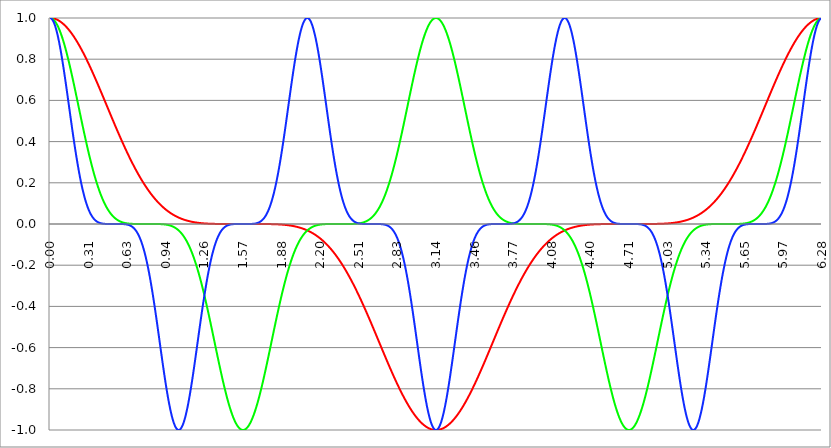
| Category | Series 1 | Series 0 | Series 2 |
|---|---|---|---|
| 0.0 | 1 | 1 | 1 |
| 0.00314159265358979 | 1 | 1 | 1 |
| 0.00628318530717958 | 1 | 1 | 0.999 |
| 0.00942477796076938 | 1 | 0.999 | 0.998 |
| 0.0125663706143592 | 1 | 0.998 | 0.996 |
| 0.015707963267949 | 0.999 | 0.998 | 0.994 |
| 0.0188495559215388 | 0.999 | 0.996 | 0.992 |
| 0.0219911485751285 | 0.999 | 0.995 | 0.989 |
| 0.0251327412287183 | 0.998 | 0.994 | 0.986 |
| 0.0282743338823081 | 0.998 | 0.992 | 0.982 |
| 0.0314159265358979 | 0.998 | 0.99 | 0.978 |
| 0.0345575191894877 | 0.997 | 0.988 | 0.973 |
| 0.0376991118430775 | 0.996 | 0.986 | 0.968 |
| 0.0408407044966673 | 0.996 | 0.983 | 0.963 |
| 0.0439822971502571 | 0.995 | 0.981 | 0.957 |
| 0.0471238898038469 | 0.994 | 0.978 | 0.951 |
| 0.0502654824574367 | 0.994 | 0.975 | 0.945 |
| 0.0534070751110265 | 0.993 | 0.972 | 0.938 |
| 0.0565486677646163 | 0.992 | 0.968 | 0.93 |
| 0.059690260418206 | 0.991 | 0.965 | 0.923 |
| 0.0628318530717958 | 0.99 | 0.961 | 0.915 |
| 0.0659734457253856 | 0.989 | 0.957 | 0.906 |
| 0.0691150383789754 | 0.988 | 0.953 | 0.897 |
| 0.0722566310325652 | 0.987 | 0.949 | 0.888 |
| 0.075398223686155 | 0.986 | 0.945 | 0.879 |
| 0.0785398163397448 | 0.985 | 0.94 | 0.869 |
| 0.0816814089933346 | 0.983 | 0.935 | 0.859 |
| 0.0848230016469244 | 0.982 | 0.93 | 0.849 |
| 0.0879645943005142 | 0.981 | 0.925 | 0.838 |
| 0.091106186954104 | 0.979 | 0.92 | 0.828 |
| 0.0942477796076937 | 0.978 | 0.915 | 0.817 |
| 0.0973893722612835 | 0.977 | 0.909 | 0.805 |
| 0.100530964914873 | 0.975 | 0.903 | 0.794 |
| 0.103672557568463 | 0.973 | 0.897 | 0.782 |
| 0.106814150222053 | 0.972 | 0.891 | 0.77 |
| 0.109955742875643 | 0.97 | 0.885 | 0.758 |
| 0.113097335529233 | 0.968 | 0.879 | 0.746 |
| 0.116238928182822 | 0.967 | 0.873 | 0.733 |
| 0.119380520836412 | 0.965 | 0.866 | 0.721 |
| 0.122522113490002 | 0.963 | 0.859 | 0.708 |
| 0.125663706143592 | 0.961 | 0.852 | 0.695 |
| 0.128805298797181 | 0.959 | 0.846 | 0.682 |
| 0.131946891450771 | 0.957 | 0.838 | 0.669 |
| 0.135088484104361 | 0.955 | 0.831 | 0.655 |
| 0.138230076757951 | 0.953 | 0.824 | 0.642 |
| 0.141371669411541 | 0.951 | 0.817 | 0.629 |
| 0.14451326206513 | 0.949 | 0.809 | 0.615 |
| 0.14765485471872 | 0.947 | 0.802 | 0.602 |
| 0.15079644737231 | 0.945 | 0.794 | 0.589 |
| 0.1539380400259 | 0.942 | 0.786 | 0.575 |
| 0.15707963267949 | 0.94 | 0.778 | 0.562 |
| 0.160221225333079 | 0.938 | 0.77 | 0.548 |
| 0.163362817986669 | 0.935 | 0.762 | 0.535 |
| 0.166504410640259 | 0.933 | 0.754 | 0.521 |
| 0.169646003293849 | 0.93 | 0.746 | 0.508 |
| 0.172787595947439 | 0.928 | 0.737 | 0.495 |
| 0.175929188601028 | 0.925 | 0.729 | 0.481 |
| 0.179070781254618 | 0.923 | 0.721 | 0.468 |
| 0.182212373908208 | 0.92 | 0.712 | 0.455 |
| 0.185353966561798 | 0.917 | 0.703 | 0.442 |
| 0.188495559215388 | 0.915 | 0.695 | 0.429 |
| 0.191637151868977 | 0.912 | 0.686 | 0.416 |
| 0.194778744522567 | 0.909 | 0.677 | 0.404 |
| 0.197920337176157 | 0.906 | 0.669 | 0.391 |
| 0.201061929829747 | 0.903 | 0.66 | 0.379 |
| 0.204203522483336 | 0.9 | 0.651 | 0.367 |
| 0.207345115136926 | 0.897 | 0.642 | 0.355 |
| 0.210486707790516 | 0.894 | 0.633 | 0.343 |
| 0.213628300444106 | 0.891 | 0.624 | 0.331 |
| 0.216769893097696 | 0.888 | 0.615 | 0.319 |
| 0.219911485751285 | 0.885 | 0.606 | 0.308 |
| 0.223053078404875 | 0.882 | 0.598 | 0.297 |
| 0.226194671058465 | 0.879 | 0.589 | 0.286 |
| 0.229336263712055 | 0.876 | 0.58 | 0.275 |
| 0.232477856365645 | 0.873 | 0.571 | 0.265 |
| 0.235619449019234 | 0.869 | 0.562 | 0.254 |
| 0.238761041672824 | 0.866 | 0.553 | 0.244 |
| 0.241902634326414 | 0.863 | 0.544 | 0.234 |
| 0.245044226980004 | 0.859 | 0.535 | 0.225 |
| 0.248185819633594 | 0.856 | 0.526 | 0.215 |
| 0.251327412287183 | 0.852 | 0.517 | 0.206 |
| 0.254469004940773 | 0.849 | 0.508 | 0.197 |
| 0.257610597594363 | 0.846 | 0.499 | 0.188 |
| 0.260752190247953 | 0.842 | 0.49 | 0.18 |
| 0.263893782901543 | 0.838 | 0.481 | 0.171 |
| 0.267035375555132 | 0.835 | 0.472 | 0.163 |
| 0.270176968208722 | 0.831 | 0.464 | 0.155 |
| 0.273318560862312 | 0.828 | 0.455 | 0.148 |
| 0.276460153515902 | 0.824 | 0.446 | 0.14 |
| 0.279601746169492 | 0.82 | 0.438 | 0.133 |
| 0.282743338823082 | 0.817 | 0.429 | 0.126 |
| 0.285884931476671 | 0.813 | 0.421 | 0.12 |
| 0.289026524130261 | 0.809 | 0.412 | 0.113 |
| 0.292168116783851 | 0.805 | 0.404 | 0.107 |
| 0.295309709437441 | 0.802 | 0.395 | 0.101 |
| 0.298451302091031 | 0.798 | 0.387 | 0.096 |
| 0.30159289474462 | 0.794 | 0.379 | 0.09 |
| 0.30473448739821 | 0.79 | 0.371 | 0.085 |
| 0.3078760800518 | 0.786 | 0.363 | 0.08 |
| 0.31101767270539 | 0.782 | 0.355 | 0.075 |
| 0.31415926535898 | 0.778 | 0.347 | 0.07 |
| 0.31730085801257 | 0.774 | 0.339 | 0.066 |
| 0.320442450666159 | 0.77 | 0.331 | 0.061 |
| 0.323584043319749 | 0.766 | 0.323 | 0.057 |
| 0.326725635973339 | 0.762 | 0.316 | 0.054 |
| 0.329867228626929 | 0.758 | 0.308 | 0.05 |
| 0.333008821280519 | 0.754 | 0.301 | 0.046 |
| 0.336150413934108 | 0.75 | 0.293 | 0.043 |
| 0.339292006587698 | 0.746 | 0.286 | 0.04 |
| 0.342433599241288 | 0.742 | 0.279 | 0.037 |
| 0.345575191894878 | 0.737 | 0.272 | 0.034 |
| 0.348716784548468 | 0.733 | 0.265 | 0.032 |
| 0.351858377202058 | 0.729 | 0.258 | 0.029 |
| 0.354999969855647 | 0.725 | 0.251 | 0.027 |
| 0.358141562509237 | 0.721 | 0.244 | 0.024 |
| 0.361283155162827 | 0.716 | 0.237 | 0.022 |
| 0.364424747816417 | 0.712 | 0.231 | 0.021 |
| 0.367566340470007 | 0.708 | 0.225 | 0.019 |
| 0.370707933123597 | 0.703 | 0.218 | 0.017 |
| 0.373849525777186 | 0.699 | 0.212 | 0.015 |
| 0.376991118430776 | 0.695 | 0.206 | 0.014 |
| 0.380132711084366 | 0.691 | 0.2 | 0.013 |
| 0.383274303737956 | 0.686 | 0.194 | 0.011 |
| 0.386415896391546 | 0.682 | 0.188 | 0.01 |
| 0.389557489045135 | 0.677 | 0.182 | 0.009 |
| 0.392699081698725 | 0.673 | 0.177 | 0.008 |
| 0.395840674352315 | 0.669 | 0.171 | 0.007 |
| 0.398982267005905 | 0.664 | 0.166 | 0.006 |
| 0.402123859659495 | 0.66 | 0.161 | 0.006 |
| 0.405265452313085 | 0.655 | 0.155 | 0.005 |
| 0.408407044966674 | 0.651 | 0.15 | 0.004 |
| 0.411548637620264 | 0.647 | 0.145 | 0.004 |
| 0.414690230273854 | 0.642 | 0.14 | 0.003 |
| 0.417831822927444 | 0.638 | 0.136 | 0.003 |
| 0.420973415581034 | 0.633 | 0.131 | 0.003 |
| 0.424115008234623 | 0.629 | 0.126 | 0.002 |
| 0.427256600888213 | 0.624 | 0.122 | 0.002 |
| 0.430398193541803 | 0.62 | 0.118 | 0.002 |
| 0.433539786195393 | 0.615 | 0.113 | 0.001 |
| 0.436681378848983 | 0.611 | 0.109 | 0.001 |
| 0.439822971502573 | 0.606 | 0.105 | 0.001 |
| 0.442964564156162 | 0.602 | 0.101 | 0.001 |
| 0.446106156809752 | 0.598 | 0.097 | 0.001 |
| 0.449247749463342 | 0.593 | 0.094 | 0.001 |
| 0.452389342116932 | 0.589 | 0.09 | 0 |
| 0.455530934770522 | 0.584 | 0.086 | 0 |
| 0.458672527424111 | 0.58 | 0.083 | 0 |
| 0.461814120077701 | 0.575 | 0.08 | 0 |
| 0.464955712731291 | 0.571 | 0.076 | 0 |
| 0.468097305384881 | 0.566 | 0.073 | 0 |
| 0.471238898038471 | 0.562 | 0.07 | 0 |
| 0.474380490692061 | 0.557 | 0.067 | 0 |
| 0.47752208334565 | 0.553 | 0.064 | 0 |
| 0.48066367599924 | 0.548 | 0.061 | 0 |
| 0.48380526865283 | 0.544 | 0.059 | 0 |
| 0.48694686130642 | 0.539 | 0.056 | 0 |
| 0.49008845396001 | 0.535 | 0.054 | 0 |
| 0.493230046613599 | 0.53 | 0.051 | 0 |
| 0.496371639267189 | 0.526 | 0.049 | 0 |
| 0.499513231920779 | 0.521 | 0.046 | 0 |
| 0.502654824574369 | 0.517 | 0.044 | 0 |
| 0.505796417227959 | 0.512 | 0.042 | 0 |
| 0.508938009881549 | 0.508 | 0.04 | 0 |
| 0.512079602535138 | 0.503 | 0.038 | 0 |
| 0.515221195188728 | 0.499 | 0.036 | 0 |
| 0.518362787842318 | 0.495 | 0.034 | 0 |
| 0.521504380495908 | 0.49 | 0.032 | 0 |
| 0.524645973149498 | 0.486 | 0.031 | 0 |
| 0.527787565803087 | 0.481 | 0.029 | 0 |
| 0.530929158456677 | 0.477 | 0.027 | 0 |
| 0.534070751110267 | 0.472 | 0.026 | 0 |
| 0.537212343763857 | 0.468 | 0.024 | 0 |
| 0.540353936417447 | 0.464 | 0.023 | 0 |
| 0.543495529071037 | 0.459 | 0.022 | 0 |
| 0.546637121724626 | 0.455 | 0.021 | 0 |
| 0.549778714378216 | 0.451 | 0.019 | 0 |
| 0.552920307031806 | 0.446 | 0.018 | 0 |
| 0.556061899685396 | 0.442 | 0.017 | 0 |
| 0.559203492338986 | 0.438 | 0.016 | 0 |
| 0.562345084992576 | 0.433 | 0.015 | 0 |
| 0.565486677646165 | 0.429 | 0.014 | 0 |
| 0.568628270299755 | 0.425 | 0.013 | 0 |
| 0.571769862953345 | 0.421 | 0.012 | 0 |
| 0.574911455606935 | 0.416 | 0.011 | 0 |
| 0.578053048260525 | 0.412 | 0.011 | 0 |
| 0.581194640914114 | 0.408 | 0.01 | 0 |
| 0.584336233567704 | 0.404 | 0.009 | 0 |
| 0.587477826221294 | 0.399 | 0.009 | 0 |
| 0.590619418874884 | 0.395 | 0.008 | 0 |
| 0.593761011528474 | 0.391 | 0.007 | 0 |
| 0.596902604182064 | 0.387 | 0.007 | 0 |
| 0.600044196835653 | 0.383 | 0.006 | -0.001 |
| 0.603185789489243 | 0.379 | 0.006 | -0.001 |
| 0.606327382142833 | 0.375 | 0.005 | -0.001 |
| 0.609468974796423 | 0.371 | 0.005 | -0.001 |
| 0.612610567450013 | 0.367 | 0.004 | -0.001 |
| 0.615752160103602 | 0.363 | 0.004 | -0.002 |
| 0.618893752757192 | 0.359 | 0.004 | -0.002 |
| 0.622035345410782 | 0.355 | 0.003 | -0.002 |
| 0.625176938064372 | 0.351 | 0.003 | -0.002 |
| 0.628318530717962 | 0.347 | 0.003 | -0.003 |
| 0.631460123371551 | 0.343 | 0.003 | -0.003 |
| 0.634601716025141 | 0.339 | 0.002 | -0.004 |
| 0.637743308678731 | 0.335 | 0.002 | -0.004 |
| 0.640884901332321 | 0.331 | 0.002 | -0.005 |
| 0.644026493985911 | 0.327 | 0.002 | -0.006 |
| 0.647168086639501 | 0.323 | 0.002 | -0.006 |
| 0.65030967929309 | 0.319 | 0.001 | -0.007 |
| 0.65345127194668 | 0.316 | 0.001 | -0.008 |
| 0.65659286460027 | 0.312 | 0.001 | -0.009 |
| 0.65973445725386 | 0.308 | 0.001 | -0.01 |
| 0.66287604990745 | 0.304 | 0.001 | -0.011 |
| 0.666017642561039 | 0.301 | 0.001 | -0.012 |
| 0.669159235214629 | 0.297 | 0.001 | -0.014 |
| 0.672300827868219 | 0.293 | 0.001 | -0.015 |
| 0.675442420521809 | 0.29 | 0 | -0.016 |
| 0.678584013175399 | 0.286 | 0 | -0.018 |
| 0.681725605828989 | 0.282 | 0 | -0.02 |
| 0.684867198482578 | 0.279 | 0 | -0.022 |
| 0.688008791136168 | 0.275 | 0 | -0.024 |
| 0.691150383789758 | 0.272 | 0 | -0.026 |
| 0.694291976443348 | 0.268 | 0 | -0.028 |
| 0.697433569096938 | 0.265 | 0 | -0.031 |
| 0.700575161750528 | 0.261 | 0 | -0.033 |
| 0.703716754404117 | 0.258 | 0 | -0.036 |
| 0.706858347057707 | 0.254 | 0 | -0.039 |
| 0.709999939711297 | 0.251 | 0 | -0.042 |
| 0.713141532364887 | 0.247 | 0 | -0.045 |
| 0.716283125018477 | 0.244 | 0 | -0.049 |
| 0.719424717672066 | 0.241 | 0 | -0.052 |
| 0.722566310325656 | 0.237 | 0 | -0.056 |
| 0.725707902979246 | 0.234 | 0 | -0.06 |
| 0.728849495632836 | 0.231 | 0 | -0.064 |
| 0.731991088286426 | 0.228 | 0 | -0.069 |
| 0.735132680940016 | 0.225 | 0 | -0.073 |
| 0.738274273593605 | 0.221 | 0 | -0.078 |
| 0.741415866247195 | 0.218 | 0 | -0.083 |
| 0.744557458900785 | 0.215 | 0 | -0.088 |
| 0.747699051554375 | 0.212 | 0 | -0.094 |
| 0.750840644207965 | 0.209 | 0 | -0.099 |
| 0.753982236861554 | 0.206 | 0 | -0.105 |
| 0.757123829515144 | 0.203 | 0 | -0.111 |
| 0.760265422168734 | 0.2 | 0 | -0.118 |
| 0.763407014822324 | 0.197 | 0 | -0.124 |
| 0.766548607475914 | 0.194 | 0 | -0.131 |
| 0.769690200129504 | 0.191 | 0 | -0.138 |
| 0.772831792783093 | 0.188 | 0 | -0.145 |
| 0.775973385436683 | 0.185 | 0 | -0.153 |
| 0.779114978090273 | 0.182 | 0 | -0.161 |
| 0.782256570743863 | 0.18 | 0 | -0.169 |
| 0.785398163397453 | 0.177 | 0 | -0.177 |
| 0.788539756051042 | 0.174 | 0 | -0.185 |
| 0.791681348704632 | 0.171 | 0 | -0.194 |
| 0.794822941358222 | 0.169 | 0 | -0.203 |
| 0.797964534011812 | 0.166 | 0 | -0.212 |
| 0.801106126665402 | 0.163 | 0 | -0.221 |
| 0.804247719318992 | 0.161 | 0 | -0.231 |
| 0.807389311972581 | 0.158 | 0 | -0.241 |
| 0.810530904626171 | 0.155 | 0 | -0.251 |
| 0.813672497279761 | 0.153 | 0 | -0.261 |
| 0.816814089933351 | 0.15 | 0 | -0.272 |
| 0.819955682586941 | 0.148 | 0 | -0.282 |
| 0.823097275240531 | 0.145 | 0 | -0.293 |
| 0.82623886789412 | 0.143 | 0 | -0.304 |
| 0.82938046054771 | 0.14 | 0 | -0.316 |
| 0.8325220532013 | 0.138 | 0 | -0.327 |
| 0.83566364585489 | 0.136 | 0 | -0.339 |
| 0.83880523850848 | 0.133 | 0 | -0.351 |
| 0.841946831162069 | 0.131 | 0 | -0.363 |
| 0.845088423815659 | 0.129 | 0 | -0.375 |
| 0.848230016469249 | 0.126 | 0 | -0.387 |
| 0.851371609122839 | 0.124 | 0 | -0.399 |
| 0.854513201776429 | 0.122 | 0 | -0.412 |
| 0.857654794430019 | 0.12 | 0 | -0.425 |
| 0.860796387083608 | 0.118 | 0 | -0.438 |
| 0.863937979737198 | 0.116 | 0 | -0.451 |
| 0.867079572390788 | 0.113 | 0 | -0.464 |
| 0.870221165044378 | 0.111 | 0 | -0.477 |
| 0.873362757697968 | 0.109 | 0 | -0.49 |
| 0.876504350351557 | 0.107 | 0 | -0.503 |
| 0.879645943005147 | 0.105 | 0 | -0.517 |
| 0.882787535658737 | 0.103 | 0 | -0.53 |
| 0.885929128312327 | 0.101 | 0 | -0.544 |
| 0.889070720965917 | 0.099 | 0 | -0.557 |
| 0.892212313619507 | 0.097 | 0 | -0.571 |
| 0.895353906273096 | 0.096 | 0 | -0.584 |
| 0.898495498926686 | 0.094 | -0.001 | -0.598 |
| 0.901637091580276 | 0.092 | -0.001 | -0.611 |
| 0.904778684233866 | 0.09 | -0.001 | -0.624 |
| 0.907920276887456 | 0.088 | -0.001 | -0.638 |
| 0.911061869541045 | 0.086 | -0.001 | -0.651 |
| 0.914203462194635 | 0.085 | -0.001 | -0.664 |
| 0.917345054848225 | 0.083 | -0.001 | -0.677 |
| 0.920486647501815 | 0.081 | -0.001 | -0.691 |
| 0.923628240155405 | 0.08 | -0.002 | -0.703 |
| 0.926769832808995 | 0.078 | -0.002 | -0.716 |
| 0.929911425462584 | 0.076 | -0.002 | -0.729 |
| 0.933053018116174 | 0.075 | -0.002 | -0.742 |
| 0.936194610769764 | 0.073 | -0.002 | -0.754 |
| 0.939336203423354 | 0.072 | -0.003 | -0.766 |
| 0.942477796076944 | 0.07 | -0.003 | -0.778 |
| 0.945619388730533 | 0.069 | -0.003 | -0.79 |
| 0.948760981384123 | 0.067 | -0.003 | -0.802 |
| 0.951902574037713 | 0.066 | -0.004 | -0.813 |
| 0.955044166691303 | 0.064 | -0.004 | -0.824 |
| 0.958185759344893 | 0.063 | -0.004 | -0.835 |
| 0.961327351998483 | 0.061 | -0.005 | -0.846 |
| 0.964468944652072 | 0.06 | -0.005 | -0.856 |
| 0.967610537305662 | 0.059 | -0.006 | -0.866 |
| 0.970752129959252 | 0.057 | -0.006 | -0.876 |
| 0.973893722612842 | 0.056 | -0.007 | -0.885 |
| 0.977035315266432 | 0.055 | -0.007 | -0.894 |
| 0.980176907920022 | 0.054 | -0.008 | -0.903 |
| 0.983318500573611 | 0.052 | -0.009 | -0.912 |
| 0.986460093227201 | 0.051 | -0.009 | -0.92 |
| 0.989601685880791 | 0.05 | -0.01 | -0.928 |
| 0.992743278534381 | 0.049 | -0.011 | -0.935 |
| 0.995884871187971 | 0.048 | -0.011 | -0.942 |
| 0.99902646384156 | 0.046 | -0.012 | -0.949 |
| 1.00216805649515 | 0.045 | -0.013 | -0.955 |
| 1.00530964914874 | 0.044 | -0.014 | -0.961 |
| 1.00845124180233 | 0.043 | -0.015 | -0.967 |
| 1.01159283445592 | 0.042 | -0.016 | -0.972 |
| 1.01473442710951 | 0.041 | -0.017 | -0.977 |
| 1.017876019763099 | 0.04 | -0.018 | -0.981 |
| 1.021017612416689 | 0.039 | -0.019 | -0.985 |
| 1.02415920507028 | 0.038 | -0.021 | -0.988 |
| 1.027300797723869 | 0.037 | -0.022 | -0.991 |
| 1.030442390377459 | 0.036 | -0.023 | -0.994 |
| 1.033583983031048 | 0.035 | -0.024 | -0.996 |
| 1.036725575684638 | 0.034 | -0.026 | -0.998 |
| 1.039867168338228 | 0.033 | -0.027 | -0.999 |
| 1.043008760991818 | 0.032 | -0.029 | -1 |
| 1.046150353645408 | 0.032 | -0.031 | -1 |
| 1.049291946298998 | 0.031 | -0.032 | -1 |
| 1.052433538952587 | 0.03 | -0.034 | -0.999 |
| 1.055575131606177 | 0.029 | -0.036 | -0.998 |
| 1.058716724259767 | 0.028 | -0.038 | -0.997 |
| 1.061858316913357 | 0.027 | -0.04 | -0.995 |
| 1.064999909566947 | 0.027 | -0.042 | -0.993 |
| 1.068141502220536 | 0.026 | -0.044 | -0.99 |
| 1.071283094874126 | 0.025 | -0.046 | -0.987 |
| 1.074424687527716 | 0.024 | -0.049 | -0.983 |
| 1.077566280181306 | 0.024 | -0.051 | -0.979 |
| 1.080707872834896 | 0.023 | -0.054 | -0.975 |
| 1.083849465488486 | 0.022 | -0.056 | -0.97 |
| 1.086991058142075 | 0.022 | -0.059 | -0.965 |
| 1.090132650795665 | 0.021 | -0.061 | -0.959 |
| 1.093274243449255 | 0.021 | -0.064 | -0.953 |
| 1.096415836102845 | 0.02 | -0.067 | -0.947 |
| 1.099557428756435 | 0.019 | -0.07 | -0.94 |
| 1.102699021410025 | 0.019 | -0.073 | -0.933 |
| 1.105840614063614 | 0.018 | -0.076 | -0.925 |
| 1.108982206717204 | 0.018 | -0.08 | -0.917 |
| 1.112123799370794 | 0.017 | -0.083 | -0.909 |
| 1.115265392024384 | 0.016 | -0.086 | -0.9 |
| 1.118406984677974 | 0.016 | -0.09 | -0.891 |
| 1.121548577331563 | 0.015 | -0.094 | -0.882 |
| 1.124690169985153 | 0.015 | -0.097 | -0.873 |
| 1.127831762638743 | 0.014 | -0.101 | -0.863 |
| 1.130973355292333 | 0.014 | -0.105 | -0.852 |
| 1.134114947945923 | 0.014 | -0.109 | -0.842 |
| 1.137256540599513 | 0.013 | -0.113 | -0.831 |
| 1.140398133253102 | 0.013 | -0.118 | -0.82 |
| 1.143539725906692 | 0.012 | -0.122 | -0.809 |
| 1.146681318560282 | 0.012 | -0.126 | -0.798 |
| 1.149822911213872 | 0.011 | -0.131 | -0.786 |
| 1.152964503867462 | 0.011 | -0.136 | -0.774 |
| 1.156106096521051 | 0.011 | -0.14 | -0.762 |
| 1.159247689174641 | 0.01 | -0.145 | -0.75 |
| 1.162389281828231 | 0.01 | -0.15 | -0.737 |
| 1.165530874481821 | 0.01 | -0.155 | -0.725 |
| 1.168672467135411 | 0.009 | -0.161 | -0.712 |
| 1.171814059789001 | 0.009 | -0.166 | -0.699 |
| 1.17495565244259 | 0.009 | -0.171 | -0.686 |
| 1.17809724509618 | 0.008 | -0.177 | -0.673 |
| 1.18123883774977 | 0.008 | -0.182 | -0.66 |
| 1.18438043040336 | 0.008 | -0.188 | -0.647 |
| 1.18752202305695 | 0.007 | -0.194 | -0.633 |
| 1.190663615710539 | 0.007 | -0.2 | -0.62 |
| 1.193805208364129 | 0.007 | -0.206 | -0.606 |
| 1.19694680101772 | 0.006 | -0.212 | -0.593 |
| 1.200088393671309 | 0.006 | -0.218 | -0.58 |
| 1.203229986324899 | 0.006 | -0.225 | -0.566 |
| 1.206371578978489 | 0.006 | -0.231 | -0.553 |
| 1.209513171632078 | 0.006 | -0.237 | -0.539 |
| 1.212654764285668 | 0.005 | -0.244 | -0.526 |
| 1.215796356939258 | 0.005 | -0.251 | -0.512 |
| 1.218937949592848 | 0.005 | -0.258 | -0.499 |
| 1.222079542246438 | 0.005 | -0.265 | -0.486 |
| 1.225221134900027 | 0.004 | -0.272 | -0.472 |
| 1.228362727553617 | 0.004 | -0.279 | -0.459 |
| 1.231504320207207 | 0.004 | -0.286 | -0.446 |
| 1.234645912860797 | 0.004 | -0.293 | -0.433 |
| 1.237787505514387 | 0.004 | -0.301 | -0.421 |
| 1.240929098167977 | 0.004 | -0.308 | -0.408 |
| 1.244070690821566 | 0.003 | -0.316 | -0.395 |
| 1.247212283475156 | 0.003 | -0.323 | -0.383 |
| 1.250353876128746 | 0.003 | -0.331 | -0.371 |
| 1.253495468782336 | 0.003 | -0.339 | -0.359 |
| 1.256637061435926 | 0.003 | -0.347 | -0.347 |
| 1.259778654089515 | 0.003 | -0.355 | -0.335 |
| 1.262920246743105 | 0.003 | -0.363 | -0.323 |
| 1.266061839396695 | 0.002 | -0.371 | -0.312 |
| 1.269203432050285 | 0.002 | -0.379 | -0.301 |
| 1.272345024703875 | 0.002 | -0.387 | -0.29 |
| 1.275486617357465 | 0.002 | -0.395 | -0.279 |
| 1.278628210011054 | 0.002 | -0.404 | -0.268 |
| 1.281769802664644 | 0.002 | -0.412 | -0.258 |
| 1.284911395318234 | 0.002 | -0.421 | -0.247 |
| 1.288052987971824 | 0.002 | -0.429 | -0.237 |
| 1.291194580625414 | 0.002 | -0.438 | -0.228 |
| 1.294336173279003 | 0.002 | -0.446 | -0.218 |
| 1.297477765932593 | 0.001 | -0.455 | -0.209 |
| 1.300619358586183 | 0.001 | -0.464 | -0.2 |
| 1.303760951239773 | 0.001 | -0.472 | -0.191 |
| 1.306902543893363 | 0.001 | -0.481 | -0.182 |
| 1.310044136546953 | 0.001 | -0.49 | -0.174 |
| 1.313185729200542 | 0.001 | -0.499 | -0.166 |
| 1.316327321854132 | 0.001 | -0.508 | -0.158 |
| 1.319468914507722 | 0.001 | -0.517 | -0.15 |
| 1.322610507161312 | 0.001 | -0.526 | -0.143 |
| 1.325752099814902 | 0.001 | -0.535 | -0.136 |
| 1.328893692468491 | 0.001 | -0.544 | -0.129 |
| 1.332035285122081 | 0.001 | -0.553 | -0.122 |
| 1.335176877775671 | 0.001 | -0.562 | -0.116 |
| 1.338318470429261 | 0.001 | -0.571 | -0.109 |
| 1.341460063082851 | 0.001 | -0.58 | -0.103 |
| 1.344601655736441 | 0.001 | -0.589 | -0.097 |
| 1.34774324839003 | 0.001 | -0.598 | -0.092 |
| 1.35088484104362 | 0 | -0.606 | -0.086 |
| 1.35402643369721 | 0 | -0.615 | -0.081 |
| 1.3571680263508 | 0 | -0.624 | -0.076 |
| 1.36030961900439 | 0 | -0.633 | -0.072 |
| 1.363451211657979 | 0 | -0.642 | -0.067 |
| 1.36659280431157 | 0 | -0.651 | -0.063 |
| 1.369734396965159 | 0 | -0.66 | -0.059 |
| 1.372875989618749 | 0 | -0.669 | -0.055 |
| 1.376017582272339 | 0 | -0.677 | -0.051 |
| 1.379159174925929 | 0 | -0.686 | -0.048 |
| 1.382300767579518 | 0 | -0.695 | -0.044 |
| 1.385442360233108 | 0 | -0.703 | -0.041 |
| 1.388583952886698 | 0 | -0.712 | -0.038 |
| 1.391725545540288 | 0 | -0.721 | -0.035 |
| 1.394867138193878 | 0 | -0.729 | -0.032 |
| 1.398008730847468 | 0 | -0.737 | -0.03 |
| 1.401150323501057 | 0 | -0.746 | -0.027 |
| 1.404291916154647 | 0 | -0.754 | -0.025 |
| 1.407433508808237 | 0 | -0.762 | -0.023 |
| 1.410575101461827 | 0 | -0.77 | -0.021 |
| 1.413716694115417 | 0 | -0.778 | -0.019 |
| 1.416858286769006 | 0 | -0.786 | -0.018 |
| 1.419999879422596 | 0 | -0.794 | -0.016 |
| 1.423141472076186 | 0 | -0.802 | -0.014 |
| 1.426283064729776 | 0 | -0.809 | -0.013 |
| 1.429424657383366 | 0 | -0.817 | -0.012 |
| 1.432566250036956 | 0 | -0.824 | -0.011 |
| 1.435707842690545 | 0 | -0.831 | -0.01 |
| 1.438849435344135 | 0 | -0.838 | -0.009 |
| 1.441991027997725 | 0 | -0.846 | -0.008 |
| 1.445132620651315 | 0 | -0.852 | -0.007 |
| 1.448274213304905 | 0 | -0.859 | -0.006 |
| 1.451415805958494 | 0 | -0.866 | -0.005 |
| 1.454557398612084 | 0 | -0.873 | -0.005 |
| 1.457698991265674 | 0 | -0.879 | -0.004 |
| 1.460840583919264 | 0 | -0.885 | -0.004 |
| 1.463982176572854 | 0 | -0.891 | -0.003 |
| 1.467123769226444 | 0 | -0.897 | -0.003 |
| 1.470265361880033 | 0 | -0.903 | -0.002 |
| 1.473406954533623 | 0 | -0.909 | -0.002 |
| 1.476548547187213 | 0 | -0.915 | -0.002 |
| 1.479690139840803 | 0 | -0.92 | -0.001 |
| 1.482831732494393 | 0 | -0.925 | -0.001 |
| 1.485973325147982 | 0 | -0.93 | -0.001 |
| 1.489114917801572 | 0 | -0.935 | -0.001 |
| 1.492256510455162 | 0 | -0.94 | -0.001 |
| 1.495398103108752 | 0 | -0.945 | -0.001 |
| 1.498539695762342 | 0 | -0.949 | 0 |
| 1.501681288415932 | 0 | -0.953 | 0 |
| 1.504822881069521 | 0 | -0.957 | 0 |
| 1.507964473723111 | 0 | -0.961 | 0 |
| 1.511106066376701 | 0 | -0.965 | 0 |
| 1.514247659030291 | 0 | -0.968 | 0 |
| 1.517389251683881 | 0 | -0.972 | 0 |
| 1.520530844337471 | 0 | -0.975 | 0 |
| 1.52367243699106 | 0 | -0.978 | 0 |
| 1.52681402964465 | 0 | -0.981 | 0 |
| 1.52995562229824 | 0 | -0.983 | 0 |
| 1.53309721495183 | 0 | -0.986 | 0 |
| 1.53623880760542 | 0 | -0.988 | 0 |
| 1.539380400259009 | 0 | -0.99 | 0 |
| 1.542521992912599 | 0 | -0.992 | 0 |
| 1.545663585566189 | 0 | -0.994 | 0 |
| 1.548805178219779 | 0 | -0.995 | 0 |
| 1.551946770873369 | 0 | -0.996 | 0 |
| 1.555088363526959 | 0 | -0.998 | 0 |
| 1.558229956180548 | 0 | -0.998 | 0 |
| 1.561371548834138 | 0 | -0.999 | 0 |
| 1.564513141487728 | 0 | -1 | 0 |
| 1.567654734141318 | 0 | -1 | 0 |
| 1.570796326794908 | 0 | -1 | 0 |
| 1.573937919448497 | 0 | -1 | 0 |
| 1.577079512102087 | 0 | -1 | 0 |
| 1.580221104755677 | 0 | -0.999 | 0 |
| 1.583362697409267 | 0 | -0.998 | 0 |
| 1.586504290062857 | 0 | -0.998 | 0 |
| 1.589645882716447 | 0 | -0.996 | 0 |
| 1.592787475370036 | 0 | -0.995 | 0 |
| 1.595929068023626 | 0 | -0.994 | 0 |
| 1.599070660677216 | 0 | -0.992 | 0 |
| 1.602212253330806 | 0 | -0.99 | 0 |
| 1.605353845984396 | 0 | -0.988 | 0 |
| 1.608495438637985 | 0 | -0.986 | 0 |
| 1.611637031291575 | 0 | -0.983 | 0 |
| 1.614778623945165 | 0 | -0.981 | 0 |
| 1.617920216598755 | 0 | -0.978 | 0 |
| 1.621061809252345 | 0 | -0.975 | 0 |
| 1.624203401905935 | 0 | -0.972 | 0 |
| 1.627344994559524 | 0 | -0.968 | 0 |
| 1.630486587213114 | 0 | -0.965 | 0 |
| 1.633628179866704 | 0 | -0.961 | 0 |
| 1.636769772520294 | 0 | -0.957 | 0 |
| 1.639911365173884 | 0 | -0.953 | 0 |
| 1.643052957827473 | 0 | -0.949 | 0 |
| 1.646194550481063 | 0 | -0.945 | 0.001 |
| 1.649336143134653 | 0 | -0.94 | 0.001 |
| 1.652477735788243 | 0 | -0.935 | 0.001 |
| 1.655619328441833 | 0 | -0.93 | 0.001 |
| 1.658760921095423 | 0 | -0.925 | 0.001 |
| 1.661902513749012 | 0 | -0.92 | 0.001 |
| 1.665044106402602 | 0 | -0.915 | 0.002 |
| 1.668185699056192 | 0 | -0.909 | 0.002 |
| 1.671327291709782 | 0 | -0.903 | 0.002 |
| 1.674468884363372 | 0 | -0.897 | 0.003 |
| 1.677610477016961 | 0 | -0.891 | 0.003 |
| 1.680752069670551 | 0 | -0.885 | 0.004 |
| 1.683893662324141 | 0 | -0.879 | 0.004 |
| 1.687035254977731 | 0 | -0.873 | 0.005 |
| 1.690176847631321 | 0 | -0.866 | 0.005 |
| 1.693318440284911 | 0 | -0.859 | 0.006 |
| 1.6964600329385 | 0 | -0.852 | 0.007 |
| 1.69960162559209 | 0 | -0.846 | 0.008 |
| 1.70274321824568 | 0 | -0.838 | 0.009 |
| 1.70588481089927 | 0 | -0.831 | 0.01 |
| 1.70902640355286 | 0 | -0.824 | 0.011 |
| 1.712167996206449 | 0 | -0.817 | 0.012 |
| 1.715309588860039 | 0 | -0.809 | 0.013 |
| 1.71845118151363 | 0 | -0.802 | 0.014 |
| 1.721592774167219 | 0 | -0.794 | 0.016 |
| 1.724734366820809 | 0 | -0.786 | 0.018 |
| 1.727875959474399 | 0 | -0.778 | 0.019 |
| 1.731017552127988 | 0 | -0.77 | 0.021 |
| 1.734159144781578 | 0 | -0.762 | 0.023 |
| 1.737300737435168 | 0 | -0.754 | 0.025 |
| 1.740442330088758 | 0 | -0.746 | 0.027 |
| 1.743583922742348 | 0 | -0.737 | 0.03 |
| 1.746725515395937 | 0 | -0.729 | 0.032 |
| 1.749867108049527 | 0 | -0.721 | 0.035 |
| 1.753008700703117 | 0 | -0.712 | 0.038 |
| 1.756150293356707 | 0 | -0.703 | 0.041 |
| 1.759291886010297 | 0 | -0.695 | 0.044 |
| 1.762433478663887 | 0 | -0.686 | 0.048 |
| 1.765575071317476 | 0 | -0.677 | 0.051 |
| 1.768716663971066 | 0 | -0.669 | 0.055 |
| 1.771858256624656 | 0 | -0.66 | 0.059 |
| 1.774999849278246 | 0 | -0.651 | 0.063 |
| 1.778141441931836 | 0 | -0.642 | 0.067 |
| 1.781283034585426 | 0 | -0.633 | 0.072 |
| 1.784424627239015 | 0 | -0.624 | 0.076 |
| 1.787566219892605 | 0 | -0.615 | 0.081 |
| 1.790707812546195 | 0 | -0.606 | 0.086 |
| 1.793849405199785 | -0.001 | -0.598 | 0.092 |
| 1.796990997853375 | -0.001 | -0.589 | 0.097 |
| 1.800132590506964 | -0.001 | -0.58 | 0.103 |
| 1.803274183160554 | -0.001 | -0.571 | 0.109 |
| 1.806415775814144 | -0.001 | -0.562 | 0.116 |
| 1.809557368467734 | -0.001 | -0.553 | 0.122 |
| 1.812698961121324 | -0.001 | -0.544 | 0.129 |
| 1.815840553774914 | -0.001 | -0.535 | 0.136 |
| 1.818982146428503 | -0.001 | -0.526 | 0.143 |
| 1.822123739082093 | -0.001 | -0.517 | 0.15 |
| 1.825265331735683 | -0.001 | -0.508 | 0.158 |
| 1.828406924389273 | -0.001 | -0.499 | 0.166 |
| 1.831548517042863 | -0.001 | -0.49 | 0.174 |
| 1.834690109696452 | -0.001 | -0.481 | 0.182 |
| 1.837831702350042 | -0.001 | -0.472 | 0.191 |
| 1.840973295003632 | -0.001 | -0.464 | 0.2 |
| 1.844114887657222 | -0.001 | -0.455 | 0.209 |
| 1.847256480310812 | -0.002 | -0.446 | 0.218 |
| 1.850398072964402 | -0.002 | -0.438 | 0.228 |
| 1.853539665617991 | -0.002 | -0.429 | 0.237 |
| 1.856681258271581 | -0.002 | -0.421 | 0.247 |
| 1.859822850925171 | -0.002 | -0.412 | 0.258 |
| 1.862964443578761 | -0.002 | -0.404 | 0.268 |
| 1.866106036232351 | -0.002 | -0.395 | 0.279 |
| 1.86924762888594 | -0.002 | -0.387 | 0.29 |
| 1.87238922153953 | -0.002 | -0.379 | 0.301 |
| 1.87553081419312 | -0.002 | -0.371 | 0.312 |
| 1.87867240684671 | -0.003 | -0.363 | 0.323 |
| 1.8818139995003 | -0.003 | -0.355 | 0.335 |
| 1.88495559215389 | -0.003 | -0.347 | 0.347 |
| 1.888097184807479 | -0.003 | -0.339 | 0.359 |
| 1.891238777461069 | -0.003 | -0.331 | 0.371 |
| 1.89438037011466 | -0.003 | -0.323 | 0.383 |
| 1.897521962768249 | -0.003 | -0.316 | 0.395 |
| 1.900663555421839 | -0.004 | -0.308 | 0.408 |
| 1.903805148075429 | -0.004 | -0.301 | 0.421 |
| 1.906946740729018 | -0.004 | -0.293 | 0.433 |
| 1.910088333382608 | -0.004 | -0.286 | 0.446 |
| 1.913229926036198 | -0.004 | -0.279 | 0.459 |
| 1.916371518689788 | -0.004 | -0.272 | 0.472 |
| 1.919513111343378 | -0.005 | -0.265 | 0.486 |
| 1.922654703996967 | -0.005 | -0.258 | 0.499 |
| 1.925796296650557 | -0.005 | -0.251 | 0.512 |
| 1.928937889304147 | -0.005 | -0.244 | 0.526 |
| 1.932079481957737 | -0.006 | -0.237 | 0.539 |
| 1.935221074611327 | -0.006 | -0.231 | 0.553 |
| 1.938362667264917 | -0.006 | -0.225 | 0.566 |
| 1.941504259918506 | -0.006 | -0.218 | 0.58 |
| 1.944645852572096 | -0.006 | -0.212 | 0.593 |
| 1.947787445225686 | -0.007 | -0.206 | 0.606 |
| 1.950929037879276 | -0.007 | -0.2 | 0.62 |
| 1.954070630532866 | -0.007 | -0.194 | 0.633 |
| 1.957212223186455 | -0.008 | -0.188 | 0.647 |
| 1.960353815840045 | -0.008 | -0.182 | 0.66 |
| 1.963495408493635 | -0.008 | -0.177 | 0.673 |
| 1.966637001147225 | -0.009 | -0.171 | 0.686 |
| 1.969778593800815 | -0.009 | -0.166 | 0.699 |
| 1.972920186454405 | -0.009 | -0.161 | 0.712 |
| 1.976061779107994 | -0.01 | -0.155 | 0.725 |
| 1.979203371761584 | -0.01 | -0.15 | 0.737 |
| 1.982344964415174 | -0.01 | -0.145 | 0.75 |
| 1.985486557068764 | -0.011 | -0.14 | 0.762 |
| 1.988628149722354 | -0.011 | -0.136 | 0.774 |
| 1.991769742375943 | -0.011 | -0.131 | 0.786 |
| 1.994911335029533 | -0.012 | -0.126 | 0.798 |
| 1.998052927683123 | -0.012 | -0.122 | 0.809 |
| 2.001194520336712 | -0.013 | -0.118 | 0.82 |
| 2.004336112990302 | -0.013 | -0.113 | 0.831 |
| 2.007477705643892 | -0.014 | -0.109 | 0.842 |
| 2.010619298297482 | -0.014 | -0.105 | 0.852 |
| 2.013760890951071 | -0.014 | -0.101 | 0.863 |
| 2.016902483604661 | -0.015 | -0.097 | 0.873 |
| 2.02004407625825 | -0.015 | -0.094 | 0.882 |
| 2.02318566891184 | -0.016 | -0.09 | 0.891 |
| 2.02632726156543 | -0.016 | -0.086 | 0.9 |
| 2.029468854219019 | -0.017 | -0.083 | 0.909 |
| 2.032610446872609 | -0.018 | -0.08 | 0.917 |
| 2.035752039526198 | -0.018 | -0.076 | 0.925 |
| 2.038893632179788 | -0.019 | -0.073 | 0.933 |
| 2.042035224833378 | -0.019 | -0.07 | 0.94 |
| 2.045176817486967 | -0.02 | -0.067 | 0.947 |
| 2.048318410140557 | -0.021 | -0.064 | 0.953 |
| 2.051460002794146 | -0.021 | -0.061 | 0.959 |
| 2.054601595447736 | -0.022 | -0.059 | 0.965 |
| 2.057743188101325 | -0.022 | -0.056 | 0.97 |
| 2.060884780754915 | -0.023 | -0.054 | 0.975 |
| 2.064026373408505 | -0.024 | -0.051 | 0.979 |
| 2.067167966062094 | -0.024 | -0.049 | 0.983 |
| 2.070309558715684 | -0.025 | -0.046 | 0.987 |
| 2.073451151369273 | -0.026 | -0.044 | 0.99 |
| 2.076592744022863 | -0.027 | -0.042 | 0.993 |
| 2.079734336676452 | -0.027 | -0.04 | 0.995 |
| 2.082875929330042 | -0.028 | -0.038 | 0.997 |
| 2.086017521983632 | -0.029 | -0.036 | 0.998 |
| 2.089159114637221 | -0.03 | -0.034 | 0.999 |
| 2.092300707290811 | -0.031 | -0.032 | 1 |
| 2.095442299944401 | -0.032 | -0.031 | 1 |
| 2.09858389259799 | -0.032 | -0.029 | 1 |
| 2.10172548525158 | -0.033 | -0.027 | 0.999 |
| 2.104867077905169 | -0.034 | -0.026 | 0.998 |
| 2.108008670558759 | -0.035 | -0.024 | 0.996 |
| 2.111150263212349 | -0.036 | -0.023 | 0.994 |
| 2.114291855865938 | -0.037 | -0.022 | 0.991 |
| 2.117433448519528 | -0.038 | -0.021 | 0.988 |
| 2.120575041173117 | -0.039 | -0.019 | 0.985 |
| 2.123716633826707 | -0.04 | -0.018 | 0.981 |
| 2.126858226480297 | -0.041 | -0.017 | 0.977 |
| 2.129999819133886 | -0.042 | -0.016 | 0.972 |
| 2.133141411787476 | -0.043 | -0.015 | 0.967 |
| 2.136283004441065 | -0.044 | -0.014 | 0.961 |
| 2.139424597094655 | -0.045 | -0.013 | 0.955 |
| 2.142566189748245 | -0.046 | -0.012 | 0.949 |
| 2.145707782401834 | -0.048 | -0.011 | 0.942 |
| 2.148849375055424 | -0.049 | -0.011 | 0.935 |
| 2.151990967709013 | -0.05 | -0.01 | 0.928 |
| 2.155132560362603 | -0.051 | -0.009 | 0.92 |
| 2.158274153016193 | -0.052 | -0.009 | 0.912 |
| 2.161415745669782 | -0.054 | -0.008 | 0.903 |
| 2.164557338323372 | -0.055 | -0.007 | 0.894 |
| 2.167698930976961 | -0.056 | -0.007 | 0.885 |
| 2.170840523630551 | -0.057 | -0.006 | 0.876 |
| 2.173982116284141 | -0.059 | -0.006 | 0.866 |
| 2.17712370893773 | -0.06 | -0.005 | 0.856 |
| 2.18026530159132 | -0.061 | -0.005 | 0.846 |
| 2.183406894244909 | -0.063 | -0.004 | 0.835 |
| 2.186548486898499 | -0.064 | -0.004 | 0.824 |
| 2.189690079552089 | -0.066 | -0.004 | 0.813 |
| 2.192831672205678 | -0.067 | -0.003 | 0.802 |
| 2.195973264859268 | -0.069 | -0.003 | 0.79 |
| 2.199114857512857 | -0.07 | -0.003 | 0.778 |
| 2.202256450166447 | -0.072 | -0.003 | 0.766 |
| 2.205398042820036 | -0.073 | -0.002 | 0.754 |
| 2.208539635473626 | -0.075 | -0.002 | 0.742 |
| 2.211681228127216 | -0.076 | -0.002 | 0.729 |
| 2.214822820780805 | -0.078 | -0.002 | 0.716 |
| 2.217964413434395 | -0.08 | -0.002 | 0.703 |
| 2.221106006087984 | -0.081 | -0.001 | 0.691 |
| 2.224247598741574 | -0.083 | -0.001 | 0.677 |
| 2.227389191395164 | -0.085 | -0.001 | 0.664 |
| 2.230530784048753 | -0.086 | -0.001 | 0.651 |
| 2.233672376702343 | -0.088 | -0.001 | 0.638 |
| 2.236813969355933 | -0.09 | -0.001 | 0.624 |
| 2.239955562009522 | -0.092 | -0.001 | 0.611 |
| 2.243097154663112 | -0.094 | -0.001 | 0.598 |
| 2.246238747316701 | -0.096 | 0 | 0.584 |
| 2.249380339970291 | -0.097 | 0 | 0.571 |
| 2.252521932623881 | -0.099 | 0 | 0.557 |
| 2.25566352527747 | -0.101 | 0 | 0.544 |
| 2.25880511793106 | -0.103 | 0 | 0.53 |
| 2.261946710584649 | -0.105 | 0 | 0.517 |
| 2.265088303238239 | -0.107 | 0 | 0.503 |
| 2.268229895891829 | -0.109 | 0 | 0.49 |
| 2.271371488545418 | -0.111 | 0 | 0.477 |
| 2.274513081199008 | -0.113 | 0 | 0.464 |
| 2.277654673852597 | -0.116 | 0 | 0.451 |
| 2.280796266506186 | -0.118 | 0 | 0.438 |
| 2.283937859159776 | -0.12 | 0 | 0.425 |
| 2.287079451813366 | -0.122 | 0 | 0.412 |
| 2.290221044466955 | -0.124 | 0 | 0.399 |
| 2.293362637120545 | -0.126 | 0 | 0.387 |
| 2.296504229774135 | -0.129 | 0 | 0.375 |
| 2.299645822427724 | -0.131 | 0 | 0.363 |
| 2.302787415081314 | -0.133 | 0 | 0.351 |
| 2.305929007734904 | -0.136 | 0 | 0.339 |
| 2.309070600388493 | -0.138 | 0 | 0.327 |
| 2.312212193042083 | -0.14 | 0 | 0.316 |
| 2.315353785695672 | -0.143 | 0 | 0.304 |
| 2.318495378349262 | -0.145 | 0 | 0.293 |
| 2.321636971002852 | -0.148 | 0 | 0.282 |
| 2.324778563656441 | -0.15 | 0 | 0.272 |
| 2.327920156310031 | -0.153 | 0 | 0.261 |
| 2.33106174896362 | -0.155 | 0 | 0.251 |
| 2.33420334161721 | -0.158 | 0 | 0.241 |
| 2.3373449342708 | -0.161 | 0 | 0.231 |
| 2.340486526924389 | -0.163 | 0 | 0.221 |
| 2.343628119577979 | -0.166 | 0 | 0.212 |
| 2.346769712231568 | -0.169 | 0 | 0.203 |
| 2.349911304885158 | -0.171 | 0 | 0.194 |
| 2.353052897538748 | -0.174 | 0 | 0.185 |
| 2.356194490192337 | -0.177 | 0 | 0.177 |
| 2.359336082845927 | -0.18 | 0 | 0.169 |
| 2.362477675499516 | -0.182 | 0 | 0.161 |
| 2.365619268153106 | -0.185 | 0 | 0.153 |
| 2.368760860806696 | -0.188 | 0 | 0.145 |
| 2.371902453460285 | -0.191 | 0 | 0.138 |
| 2.375044046113875 | -0.194 | 0 | 0.131 |
| 2.378185638767464 | -0.197 | 0 | 0.124 |
| 2.381327231421054 | -0.2 | 0 | 0.118 |
| 2.384468824074644 | -0.203 | 0 | 0.111 |
| 2.387610416728233 | -0.206 | 0 | 0.105 |
| 2.390752009381823 | -0.209 | 0 | 0.099 |
| 2.393893602035412 | -0.212 | 0 | 0.094 |
| 2.397035194689002 | -0.215 | 0 | 0.088 |
| 2.400176787342591 | -0.218 | 0 | 0.083 |
| 2.403318379996181 | -0.221 | 0 | 0.078 |
| 2.406459972649771 | -0.225 | 0 | 0.073 |
| 2.40960156530336 | -0.228 | 0 | 0.069 |
| 2.41274315795695 | -0.231 | 0 | 0.064 |
| 2.41588475061054 | -0.234 | 0 | 0.06 |
| 2.419026343264129 | -0.237 | 0 | 0.056 |
| 2.422167935917719 | -0.241 | 0 | 0.052 |
| 2.425309528571308 | -0.244 | 0 | 0.049 |
| 2.428451121224898 | -0.247 | 0 | 0.045 |
| 2.431592713878488 | -0.251 | 0 | 0.042 |
| 2.434734306532077 | -0.254 | 0 | 0.039 |
| 2.437875899185667 | -0.258 | 0 | 0.036 |
| 2.441017491839256 | -0.261 | 0 | 0.033 |
| 2.444159084492846 | -0.265 | 0 | 0.031 |
| 2.447300677146435 | -0.268 | 0 | 0.028 |
| 2.450442269800025 | -0.272 | 0 | 0.026 |
| 2.453583862453615 | -0.275 | 0 | 0.024 |
| 2.456725455107204 | -0.279 | 0 | 0.022 |
| 2.459867047760794 | -0.282 | 0 | 0.02 |
| 2.463008640414384 | -0.286 | 0 | 0.018 |
| 2.466150233067973 | -0.29 | 0 | 0.016 |
| 2.469291825721563 | -0.293 | 0.001 | 0.015 |
| 2.472433418375152 | -0.297 | 0.001 | 0.014 |
| 2.475575011028742 | -0.301 | 0.001 | 0.012 |
| 2.478716603682332 | -0.304 | 0.001 | 0.011 |
| 2.481858196335921 | -0.308 | 0.001 | 0.01 |
| 2.48499978898951 | -0.312 | 0.001 | 0.009 |
| 2.4881413816431 | -0.316 | 0.001 | 0.008 |
| 2.49128297429669 | -0.319 | 0.001 | 0.007 |
| 2.49442456695028 | -0.323 | 0.002 | 0.006 |
| 2.497566159603869 | -0.327 | 0.002 | 0.006 |
| 2.500707752257458 | -0.331 | 0.002 | 0.005 |
| 2.503849344911048 | -0.335 | 0.002 | 0.004 |
| 2.506990937564638 | -0.339 | 0.002 | 0.004 |
| 2.510132530218228 | -0.343 | 0.003 | 0.003 |
| 2.513274122871817 | -0.347 | 0.003 | 0.003 |
| 2.516415715525407 | -0.351 | 0.003 | 0.002 |
| 2.519557308178996 | -0.355 | 0.003 | 0.002 |
| 2.522698900832586 | -0.359 | 0.004 | 0.002 |
| 2.525840493486176 | -0.363 | 0.004 | 0.002 |
| 2.528982086139765 | -0.367 | 0.004 | 0.001 |
| 2.532123678793355 | -0.371 | 0.005 | 0.001 |
| 2.535265271446944 | -0.375 | 0.005 | 0.001 |
| 2.538406864100534 | -0.379 | 0.006 | 0.001 |
| 2.541548456754124 | -0.383 | 0.006 | 0.001 |
| 2.544690049407713 | -0.387 | 0.007 | 0 |
| 2.547831642061302 | -0.391 | 0.007 | 0 |
| 2.550973234714892 | -0.395 | 0.008 | 0 |
| 2.554114827368482 | -0.399 | 0.009 | 0 |
| 2.557256420022072 | -0.404 | 0.009 | 0 |
| 2.560398012675661 | -0.408 | 0.01 | 0 |
| 2.563539605329251 | -0.412 | 0.011 | 0 |
| 2.56668119798284 | -0.416 | 0.011 | 0 |
| 2.56982279063643 | -0.421 | 0.012 | 0 |
| 2.57296438329002 | -0.425 | 0.013 | 0 |
| 2.576105975943609 | -0.429 | 0.014 | 0 |
| 2.579247568597199 | -0.433 | 0.015 | 0 |
| 2.582389161250788 | -0.438 | 0.016 | 0 |
| 2.585530753904377 | -0.442 | 0.017 | 0 |
| 2.588672346557967 | -0.446 | 0.018 | 0 |
| 2.591813939211557 | -0.451 | 0.019 | 0 |
| 2.594955531865147 | -0.455 | 0.021 | 0 |
| 2.598097124518736 | -0.459 | 0.022 | 0 |
| 2.601238717172326 | -0.464 | 0.023 | 0 |
| 2.604380309825915 | -0.468 | 0.024 | 0 |
| 2.607521902479505 | -0.472 | 0.026 | 0 |
| 2.610663495133095 | -0.477 | 0.027 | 0 |
| 2.613805087786684 | -0.481 | 0.029 | 0 |
| 2.616946680440274 | -0.486 | 0.031 | 0 |
| 2.620088273093863 | -0.49 | 0.032 | 0 |
| 2.623229865747452 | -0.495 | 0.034 | 0 |
| 2.626371458401042 | -0.499 | 0.036 | 0 |
| 2.629513051054632 | -0.503 | 0.038 | 0 |
| 2.632654643708222 | -0.508 | 0.04 | 0 |
| 2.635796236361811 | -0.512 | 0.042 | 0 |
| 2.638937829015401 | -0.517 | 0.044 | 0 |
| 2.642079421668991 | -0.521 | 0.046 | 0 |
| 2.64522101432258 | -0.526 | 0.049 | 0 |
| 2.64836260697617 | -0.53 | 0.051 | 0 |
| 2.651504199629759 | -0.535 | 0.054 | 0 |
| 2.654645792283349 | -0.539 | 0.056 | 0 |
| 2.657787384936938 | -0.544 | 0.059 | 0 |
| 2.660928977590528 | -0.548 | 0.061 | 0 |
| 2.664070570244118 | -0.553 | 0.064 | 0 |
| 2.667212162897707 | -0.557 | 0.067 | 0 |
| 2.670353755551297 | -0.562 | 0.07 | 0 |
| 2.673495348204887 | -0.566 | 0.073 | 0 |
| 2.676636940858476 | -0.571 | 0.076 | 0 |
| 2.679778533512066 | -0.575 | 0.08 | 0 |
| 2.682920126165655 | -0.58 | 0.083 | 0 |
| 2.686061718819245 | -0.584 | 0.086 | 0 |
| 2.689203311472835 | -0.589 | 0.09 | 0 |
| 2.692344904126424 | -0.593 | 0.094 | -0.001 |
| 2.695486496780014 | -0.598 | 0.097 | -0.001 |
| 2.698628089433603 | -0.602 | 0.101 | -0.001 |
| 2.701769682087193 | -0.606 | 0.105 | -0.001 |
| 2.704911274740782 | -0.611 | 0.109 | -0.001 |
| 2.708052867394372 | -0.615 | 0.113 | -0.001 |
| 2.711194460047962 | -0.62 | 0.118 | -0.002 |
| 2.714336052701551 | -0.624 | 0.122 | -0.002 |
| 2.717477645355141 | -0.629 | 0.126 | -0.002 |
| 2.720619238008731 | -0.633 | 0.131 | -0.003 |
| 2.72376083066232 | -0.638 | 0.136 | -0.003 |
| 2.72690242331591 | -0.642 | 0.14 | -0.003 |
| 2.730044015969499 | -0.647 | 0.145 | -0.004 |
| 2.733185608623089 | -0.651 | 0.15 | -0.004 |
| 2.736327201276678 | -0.655 | 0.155 | -0.005 |
| 2.739468793930268 | -0.66 | 0.161 | -0.006 |
| 2.742610386583858 | -0.664 | 0.166 | -0.006 |
| 2.745751979237447 | -0.669 | 0.171 | -0.007 |
| 2.748893571891036 | -0.673 | 0.177 | -0.008 |
| 2.752035164544627 | -0.677 | 0.182 | -0.009 |
| 2.755176757198216 | -0.682 | 0.188 | -0.01 |
| 2.758318349851806 | -0.686 | 0.194 | -0.011 |
| 2.761459942505395 | -0.691 | 0.2 | -0.013 |
| 2.764601535158985 | -0.695 | 0.206 | -0.014 |
| 2.767743127812574 | -0.699 | 0.212 | -0.015 |
| 2.770884720466164 | -0.703 | 0.218 | -0.017 |
| 2.774026313119754 | -0.708 | 0.225 | -0.019 |
| 2.777167905773343 | -0.712 | 0.231 | -0.021 |
| 2.780309498426932 | -0.716 | 0.237 | -0.022 |
| 2.783451091080522 | -0.721 | 0.244 | -0.024 |
| 2.786592683734112 | -0.725 | 0.251 | -0.027 |
| 2.789734276387701 | -0.729 | 0.258 | -0.029 |
| 2.792875869041291 | -0.733 | 0.265 | -0.032 |
| 2.796017461694881 | -0.737 | 0.272 | -0.034 |
| 2.79915905434847 | -0.742 | 0.279 | -0.037 |
| 2.80230064700206 | -0.746 | 0.286 | -0.04 |
| 2.80544223965565 | -0.75 | 0.293 | -0.043 |
| 2.808583832309239 | -0.754 | 0.301 | -0.046 |
| 2.811725424962829 | -0.758 | 0.308 | -0.05 |
| 2.814867017616419 | -0.762 | 0.316 | -0.054 |
| 2.818008610270008 | -0.766 | 0.323 | -0.057 |
| 2.821150202923598 | -0.77 | 0.331 | -0.061 |
| 2.824291795577187 | -0.774 | 0.339 | -0.066 |
| 2.827433388230777 | -0.778 | 0.347 | -0.07 |
| 2.830574980884366 | -0.782 | 0.355 | -0.075 |
| 2.833716573537956 | -0.786 | 0.363 | -0.08 |
| 2.836858166191546 | -0.79 | 0.371 | -0.085 |
| 2.839999758845135 | -0.794 | 0.379 | -0.09 |
| 2.843141351498725 | -0.798 | 0.387 | -0.096 |
| 2.846282944152314 | -0.802 | 0.395 | -0.101 |
| 2.849424536805904 | -0.805 | 0.404 | -0.107 |
| 2.852566129459494 | -0.809 | 0.412 | -0.113 |
| 2.855707722113083 | -0.813 | 0.421 | -0.12 |
| 2.858849314766673 | -0.817 | 0.429 | -0.126 |
| 2.861990907420262 | -0.82 | 0.438 | -0.133 |
| 2.865132500073852 | -0.824 | 0.446 | -0.14 |
| 2.868274092727442 | -0.828 | 0.455 | -0.148 |
| 2.871415685381031 | -0.831 | 0.464 | -0.155 |
| 2.874557278034621 | -0.835 | 0.472 | -0.163 |
| 2.87769887068821 | -0.838 | 0.481 | -0.171 |
| 2.8808404633418 | -0.842 | 0.49 | -0.18 |
| 2.88398205599539 | -0.846 | 0.499 | -0.188 |
| 2.88712364864898 | -0.849 | 0.508 | -0.197 |
| 2.890265241302569 | -0.852 | 0.517 | -0.206 |
| 2.893406833956158 | -0.856 | 0.526 | -0.215 |
| 2.896548426609748 | -0.859 | 0.535 | -0.225 |
| 2.899690019263338 | -0.863 | 0.544 | -0.234 |
| 2.902831611916927 | -0.866 | 0.553 | -0.244 |
| 2.905973204570517 | -0.869 | 0.562 | -0.254 |
| 2.909114797224106 | -0.873 | 0.571 | -0.265 |
| 2.912256389877696 | -0.876 | 0.58 | -0.275 |
| 2.915397982531286 | -0.879 | 0.589 | -0.286 |
| 2.918539575184875 | -0.882 | 0.598 | -0.297 |
| 2.921681167838465 | -0.885 | 0.606 | -0.308 |
| 2.924822760492054 | -0.888 | 0.615 | -0.319 |
| 2.927964353145644 | -0.891 | 0.624 | -0.331 |
| 2.931105945799234 | -0.894 | 0.633 | -0.343 |
| 2.934247538452823 | -0.897 | 0.642 | -0.355 |
| 2.937389131106413 | -0.9 | 0.651 | -0.367 |
| 2.940530723760002 | -0.903 | 0.66 | -0.379 |
| 2.943672316413592 | -0.906 | 0.669 | -0.391 |
| 2.946813909067182 | -0.909 | 0.677 | -0.404 |
| 2.949955501720771 | -0.912 | 0.686 | -0.416 |
| 2.953097094374361 | -0.915 | 0.695 | -0.429 |
| 2.95623868702795 | -0.917 | 0.703 | -0.442 |
| 2.95938027968154 | -0.92 | 0.712 | -0.455 |
| 2.96252187233513 | -0.923 | 0.721 | -0.468 |
| 2.965663464988719 | -0.925 | 0.729 | -0.481 |
| 2.968805057642309 | -0.928 | 0.737 | -0.495 |
| 2.971946650295898 | -0.93 | 0.746 | -0.508 |
| 2.975088242949488 | -0.933 | 0.754 | -0.521 |
| 2.978229835603078 | -0.935 | 0.762 | -0.535 |
| 2.981371428256667 | -0.938 | 0.77 | -0.548 |
| 2.984513020910257 | -0.94 | 0.778 | -0.562 |
| 2.987654613563846 | -0.942 | 0.786 | -0.575 |
| 2.990796206217436 | -0.945 | 0.794 | -0.589 |
| 2.993937798871025 | -0.947 | 0.802 | -0.602 |
| 2.997079391524615 | -0.949 | 0.809 | -0.615 |
| 3.000220984178205 | -0.951 | 0.817 | -0.629 |
| 3.003362576831794 | -0.953 | 0.824 | -0.642 |
| 3.006504169485384 | -0.955 | 0.831 | -0.655 |
| 3.009645762138974 | -0.957 | 0.838 | -0.669 |
| 3.012787354792563 | -0.959 | 0.846 | -0.682 |
| 3.015928947446153 | -0.961 | 0.852 | -0.695 |
| 3.019070540099742 | -0.963 | 0.859 | -0.708 |
| 3.022212132753332 | -0.965 | 0.866 | -0.721 |
| 3.025353725406922 | -0.967 | 0.873 | -0.733 |
| 3.028495318060511 | -0.968 | 0.879 | -0.746 |
| 3.031636910714101 | -0.97 | 0.885 | -0.758 |
| 3.03477850336769 | -0.972 | 0.891 | -0.77 |
| 3.03792009602128 | -0.973 | 0.897 | -0.782 |
| 3.04106168867487 | -0.975 | 0.903 | -0.794 |
| 3.04420328132846 | -0.977 | 0.909 | -0.805 |
| 3.047344873982049 | -0.978 | 0.915 | -0.817 |
| 3.050486466635638 | -0.979 | 0.92 | -0.828 |
| 3.053628059289228 | -0.981 | 0.925 | -0.838 |
| 3.056769651942818 | -0.982 | 0.93 | -0.849 |
| 3.059911244596407 | -0.983 | 0.935 | -0.859 |
| 3.063052837249997 | -0.985 | 0.94 | -0.869 |
| 3.066194429903586 | -0.986 | 0.945 | -0.879 |
| 3.069336022557176 | -0.987 | 0.949 | -0.888 |
| 3.072477615210766 | -0.988 | 0.953 | -0.897 |
| 3.075619207864355 | -0.989 | 0.957 | -0.906 |
| 3.078760800517945 | -0.99 | 0.961 | -0.915 |
| 3.081902393171534 | -0.991 | 0.965 | -0.923 |
| 3.085043985825124 | -0.992 | 0.968 | -0.93 |
| 3.088185578478713 | -0.993 | 0.972 | -0.938 |
| 3.091327171132303 | -0.994 | 0.975 | -0.945 |
| 3.094468763785893 | -0.994 | 0.978 | -0.951 |
| 3.097610356439482 | -0.995 | 0.981 | -0.957 |
| 3.100751949093072 | -0.996 | 0.983 | -0.963 |
| 3.103893541746661 | -0.996 | 0.986 | -0.968 |
| 3.107035134400251 | -0.997 | 0.988 | -0.973 |
| 3.110176727053841 | -0.998 | 0.99 | -0.978 |
| 3.11331831970743 | -0.998 | 0.992 | -0.982 |
| 3.11645991236102 | -0.998 | 0.994 | -0.986 |
| 3.11960150501461 | -0.999 | 0.995 | -0.989 |
| 3.122743097668199 | -0.999 | 0.996 | -0.992 |
| 3.125884690321789 | -0.999 | 0.998 | -0.994 |
| 3.129026282975378 | -1 | 0.998 | -0.996 |
| 3.132167875628968 | -1 | 0.999 | -0.998 |
| 3.135309468282557 | -1 | 1 | -0.999 |
| 3.138451060936147 | -1 | 1 | -1 |
| 3.141592653589737 | -1 | 1 | -1 |
| 3.144734246243326 | -1 | 1 | -1 |
| 3.147875838896916 | -1 | 1 | -0.999 |
| 3.151017431550505 | -1 | 0.999 | -0.998 |
| 3.154159024204095 | -1 | 0.998 | -0.996 |
| 3.157300616857685 | -0.999 | 0.998 | -0.994 |
| 3.160442209511274 | -0.999 | 0.996 | -0.992 |
| 3.163583802164864 | -0.999 | 0.995 | -0.989 |
| 3.166725394818453 | -0.998 | 0.994 | -0.986 |
| 3.169866987472043 | -0.998 | 0.992 | -0.982 |
| 3.173008580125633 | -0.998 | 0.99 | -0.978 |
| 3.176150172779222 | -0.997 | 0.988 | -0.973 |
| 3.179291765432812 | -0.996 | 0.986 | -0.968 |
| 3.182433358086401 | -0.996 | 0.983 | -0.963 |
| 3.185574950739991 | -0.995 | 0.981 | -0.957 |
| 3.188716543393581 | -0.994 | 0.978 | -0.951 |
| 3.19185813604717 | -0.994 | 0.975 | -0.945 |
| 3.19499972870076 | -0.993 | 0.972 | -0.938 |
| 3.198141321354349 | -0.992 | 0.968 | -0.93 |
| 3.20128291400794 | -0.991 | 0.965 | -0.923 |
| 3.204424506661528 | -0.99 | 0.961 | -0.915 |
| 3.207566099315118 | -0.989 | 0.957 | -0.906 |
| 3.210707691968708 | -0.988 | 0.953 | -0.897 |
| 3.213849284622297 | -0.987 | 0.949 | -0.888 |
| 3.216990877275887 | -0.986 | 0.945 | -0.879 |
| 3.220132469929476 | -0.985 | 0.94 | -0.869 |
| 3.223274062583066 | -0.983 | 0.935 | -0.859 |
| 3.226415655236656 | -0.982 | 0.93 | -0.849 |
| 3.229557247890245 | -0.981 | 0.925 | -0.838 |
| 3.232698840543835 | -0.979 | 0.92 | -0.828 |
| 3.235840433197425 | -0.978 | 0.915 | -0.817 |
| 3.238982025851014 | -0.977 | 0.909 | -0.805 |
| 3.242123618504604 | -0.975 | 0.903 | -0.794 |
| 3.245265211158193 | -0.973 | 0.897 | -0.782 |
| 3.248406803811783 | -0.972 | 0.891 | -0.77 |
| 3.251548396465373 | -0.97 | 0.885 | -0.758 |
| 3.254689989118962 | -0.968 | 0.879 | -0.746 |
| 3.257831581772551 | -0.967 | 0.873 | -0.733 |
| 3.260973174426141 | -0.965 | 0.866 | -0.721 |
| 3.26411476707973 | -0.963 | 0.859 | -0.708 |
| 3.267256359733321 | -0.961 | 0.852 | -0.695 |
| 3.27039795238691 | -0.959 | 0.846 | -0.682 |
| 3.2735395450405 | -0.957 | 0.838 | -0.669 |
| 3.276681137694089 | -0.955 | 0.831 | -0.655 |
| 3.279822730347679 | -0.953 | 0.824 | -0.642 |
| 3.282964323001269 | -0.951 | 0.817 | -0.629 |
| 3.286105915654858 | -0.949 | 0.809 | -0.615 |
| 3.289247508308448 | -0.947 | 0.802 | -0.602 |
| 3.292389100962037 | -0.945 | 0.794 | -0.589 |
| 3.295530693615627 | -0.942 | 0.786 | -0.575 |
| 3.298672286269217 | -0.94 | 0.778 | -0.562 |
| 3.301813878922806 | -0.938 | 0.77 | -0.548 |
| 3.304955471576396 | -0.935 | 0.762 | -0.535 |
| 3.308097064229985 | -0.933 | 0.754 | -0.521 |
| 3.311238656883575 | -0.93 | 0.746 | -0.508 |
| 3.314380249537165 | -0.928 | 0.737 | -0.495 |
| 3.317521842190754 | -0.925 | 0.729 | -0.481 |
| 3.320663434844344 | -0.923 | 0.721 | -0.468 |
| 3.323805027497933 | -0.92 | 0.712 | -0.455 |
| 3.326946620151523 | -0.917 | 0.703 | -0.442 |
| 3.330088212805113 | -0.915 | 0.695 | -0.429 |
| 3.333229805458702 | -0.912 | 0.686 | -0.416 |
| 3.336371398112292 | -0.909 | 0.677 | -0.404 |
| 3.339512990765881 | -0.906 | 0.669 | -0.391 |
| 3.342654583419471 | -0.903 | 0.66 | -0.379 |
| 3.345796176073061 | -0.9 | 0.651 | -0.367 |
| 3.34893776872665 | -0.897 | 0.642 | -0.355 |
| 3.35207936138024 | -0.894 | 0.633 | -0.343 |
| 3.355220954033829 | -0.891 | 0.624 | -0.331 |
| 3.358362546687419 | -0.888 | 0.615 | -0.319 |
| 3.361504139341009 | -0.885 | 0.606 | -0.308 |
| 3.364645731994598 | -0.882 | 0.598 | -0.297 |
| 3.367787324648188 | -0.879 | 0.589 | -0.286 |
| 3.370928917301777 | -0.876 | 0.58 | -0.275 |
| 3.374070509955367 | -0.873 | 0.571 | -0.265 |
| 3.377212102608956 | -0.869 | 0.562 | -0.254 |
| 3.380353695262546 | -0.866 | 0.553 | -0.244 |
| 3.383495287916136 | -0.863 | 0.544 | -0.234 |
| 3.386636880569725 | -0.859 | 0.535 | -0.225 |
| 3.389778473223315 | -0.856 | 0.526 | -0.215 |
| 3.392920065876904 | -0.852 | 0.517 | -0.206 |
| 3.396061658530494 | -0.849 | 0.508 | -0.197 |
| 3.399203251184084 | -0.846 | 0.499 | -0.188 |
| 3.402344843837673 | -0.842 | 0.49 | -0.18 |
| 3.405486436491263 | -0.838 | 0.481 | -0.171 |
| 3.408628029144852 | -0.835 | 0.472 | -0.163 |
| 3.411769621798442 | -0.831 | 0.464 | -0.155 |
| 3.414911214452032 | -0.828 | 0.455 | -0.148 |
| 3.418052807105621 | -0.824 | 0.446 | -0.14 |
| 3.421194399759211 | -0.82 | 0.438 | -0.133 |
| 3.4243359924128 | -0.817 | 0.429 | -0.126 |
| 3.42747758506639 | -0.813 | 0.421 | -0.12 |
| 3.43061917771998 | -0.809 | 0.412 | -0.113 |
| 3.433760770373569 | -0.805 | 0.404 | -0.107 |
| 3.436902363027159 | -0.802 | 0.395 | -0.101 |
| 3.440043955680748 | -0.798 | 0.387 | -0.096 |
| 3.443185548334338 | -0.794 | 0.379 | -0.09 |
| 3.446327140987927 | -0.79 | 0.371 | -0.085 |
| 3.449468733641517 | -0.786 | 0.363 | -0.08 |
| 3.452610326295107 | -0.782 | 0.355 | -0.075 |
| 3.455751918948696 | -0.778 | 0.347 | -0.07 |
| 3.458893511602286 | -0.774 | 0.339 | -0.066 |
| 3.462035104255876 | -0.77 | 0.331 | -0.061 |
| 3.465176696909465 | -0.766 | 0.323 | -0.057 |
| 3.468318289563055 | -0.762 | 0.316 | -0.054 |
| 3.471459882216644 | -0.758 | 0.308 | -0.05 |
| 3.474601474870234 | -0.754 | 0.301 | -0.046 |
| 3.477743067523824 | -0.75 | 0.293 | -0.043 |
| 3.480884660177413 | -0.746 | 0.286 | -0.04 |
| 3.484026252831002 | -0.742 | 0.279 | -0.037 |
| 3.487167845484592 | -0.737 | 0.272 | -0.034 |
| 3.490309438138182 | -0.733 | 0.265 | -0.032 |
| 3.493451030791772 | -0.729 | 0.258 | -0.029 |
| 3.496592623445361 | -0.725 | 0.251 | -0.027 |
| 3.499734216098951 | -0.721 | 0.244 | -0.024 |
| 3.50287580875254 | -0.716 | 0.237 | -0.022 |
| 3.50601740140613 | -0.712 | 0.231 | -0.021 |
| 3.50915899405972 | -0.708 | 0.225 | -0.019 |
| 3.512300586713309 | -0.703 | 0.218 | -0.017 |
| 3.515442179366899 | -0.699 | 0.212 | -0.015 |
| 3.518583772020488 | -0.695 | 0.206 | -0.014 |
| 3.521725364674078 | -0.691 | 0.2 | -0.013 |
| 3.524866957327668 | -0.686 | 0.194 | -0.011 |
| 3.528008549981257 | -0.682 | 0.188 | -0.01 |
| 3.531150142634847 | -0.677 | 0.182 | -0.009 |
| 3.534291735288436 | -0.673 | 0.177 | -0.008 |
| 3.537433327942026 | -0.669 | 0.171 | -0.007 |
| 3.540574920595616 | -0.664 | 0.166 | -0.006 |
| 3.543716513249205 | -0.66 | 0.161 | -0.006 |
| 3.546858105902795 | -0.655 | 0.155 | -0.005 |
| 3.549999698556384 | -0.651 | 0.15 | -0.004 |
| 3.553141291209974 | -0.647 | 0.145 | -0.004 |
| 3.556282883863564 | -0.642 | 0.14 | -0.003 |
| 3.559424476517153 | -0.638 | 0.136 | -0.003 |
| 3.562566069170743 | -0.633 | 0.131 | -0.003 |
| 3.565707661824332 | -0.629 | 0.126 | -0.002 |
| 3.568849254477922 | -0.624 | 0.122 | -0.002 |
| 3.571990847131511 | -0.62 | 0.118 | -0.002 |
| 3.575132439785101 | -0.615 | 0.113 | -0.001 |
| 3.578274032438691 | -0.611 | 0.109 | -0.001 |
| 3.58141562509228 | -0.606 | 0.105 | -0.001 |
| 3.58455721774587 | -0.602 | 0.101 | -0.001 |
| 3.58769881039946 | -0.598 | 0.097 | -0.001 |
| 3.590840403053049 | -0.593 | 0.094 | -0.001 |
| 3.593981995706639 | -0.589 | 0.09 | 0 |
| 3.597123588360228 | -0.584 | 0.086 | 0 |
| 3.600265181013818 | -0.58 | 0.083 | 0 |
| 3.603406773667407 | -0.575 | 0.08 | 0 |
| 3.606548366320997 | -0.571 | 0.076 | 0 |
| 3.609689958974587 | -0.566 | 0.073 | 0 |
| 3.612831551628176 | -0.562 | 0.07 | 0 |
| 3.615973144281766 | -0.557 | 0.067 | 0 |
| 3.619114736935355 | -0.553 | 0.064 | 0 |
| 3.622256329588945 | -0.548 | 0.061 | 0 |
| 3.625397922242534 | -0.544 | 0.059 | 0 |
| 3.628539514896124 | -0.539 | 0.056 | 0 |
| 3.631681107549714 | -0.535 | 0.054 | 0 |
| 3.634822700203303 | -0.53 | 0.051 | 0 |
| 3.637964292856893 | -0.526 | 0.049 | 0 |
| 3.641105885510483 | -0.521 | 0.046 | 0 |
| 3.644247478164072 | -0.517 | 0.044 | 0 |
| 3.647389070817662 | -0.512 | 0.042 | 0 |
| 3.650530663471251 | -0.508 | 0.04 | 0 |
| 3.653672256124841 | -0.503 | 0.038 | 0 |
| 3.656813848778431 | -0.499 | 0.036 | 0 |
| 3.65995544143202 | -0.495 | 0.034 | 0 |
| 3.66309703408561 | -0.49 | 0.032 | 0 |
| 3.666238626739199 | -0.486 | 0.031 | 0 |
| 3.66938021939279 | -0.481 | 0.029 | 0 |
| 3.672521812046378 | -0.477 | 0.027 | 0 |
| 3.675663404699968 | -0.472 | 0.026 | 0 |
| 3.678804997353558 | -0.468 | 0.024 | 0 |
| 3.681946590007147 | -0.464 | 0.023 | 0 |
| 3.685088182660737 | -0.459 | 0.022 | 0 |
| 3.688229775314326 | -0.455 | 0.021 | 0 |
| 3.691371367967916 | -0.451 | 0.019 | 0 |
| 3.694512960621506 | -0.446 | 0.018 | 0 |
| 3.697654553275095 | -0.442 | 0.017 | 0 |
| 3.700796145928685 | -0.438 | 0.016 | 0 |
| 3.703937738582274 | -0.433 | 0.015 | 0 |
| 3.707079331235864 | -0.429 | 0.014 | 0 |
| 3.710220923889454 | -0.425 | 0.013 | 0 |
| 3.713362516543043 | -0.421 | 0.012 | 0 |
| 3.716504109196633 | -0.416 | 0.011 | 0 |
| 3.719645701850223 | -0.412 | 0.011 | 0 |
| 3.722787294503812 | -0.408 | 0.01 | 0 |
| 3.725928887157402 | -0.404 | 0.009 | 0 |
| 3.729070479810991 | -0.399 | 0.009 | 0 |
| 3.732212072464581 | -0.395 | 0.008 | 0 |
| 3.735353665118171 | -0.391 | 0.007 | 0 |
| 3.73849525777176 | -0.387 | 0.007 | 0 |
| 3.74163685042535 | -0.383 | 0.006 | 0.001 |
| 3.744778443078939 | -0.379 | 0.006 | 0.001 |
| 3.747920035732529 | -0.375 | 0.005 | 0.001 |
| 3.751061628386119 | -0.371 | 0.005 | 0.001 |
| 3.754203221039708 | -0.367 | 0.004 | 0.001 |
| 3.757344813693298 | -0.363 | 0.004 | 0.002 |
| 3.760486406346887 | -0.359 | 0.004 | 0.002 |
| 3.763627999000477 | -0.355 | 0.003 | 0.002 |
| 3.766769591654067 | -0.351 | 0.003 | 0.002 |
| 3.769911184307656 | -0.347 | 0.003 | 0.003 |
| 3.773052776961246 | -0.343 | 0.003 | 0.003 |
| 3.776194369614835 | -0.339 | 0.002 | 0.004 |
| 3.779335962268425 | -0.335 | 0.002 | 0.004 |
| 3.782477554922014 | -0.331 | 0.002 | 0.005 |
| 3.785619147575604 | -0.327 | 0.002 | 0.006 |
| 3.788760740229193 | -0.323 | 0.002 | 0.006 |
| 3.791902332882783 | -0.319 | 0.001 | 0.007 |
| 3.795043925536373 | -0.316 | 0.001 | 0.008 |
| 3.798185518189962 | -0.312 | 0.001 | 0.009 |
| 3.801327110843552 | -0.308 | 0.001 | 0.01 |
| 3.804468703497142 | -0.304 | 0.001 | 0.011 |
| 3.807610296150731 | -0.301 | 0.001 | 0.012 |
| 3.810751888804321 | -0.297 | 0.001 | 0.014 |
| 3.813893481457911 | -0.293 | 0.001 | 0.015 |
| 3.8170350741115 | -0.29 | 0 | 0.016 |
| 3.82017666676509 | -0.286 | 0 | 0.018 |
| 3.823318259418679 | -0.282 | 0 | 0.02 |
| 3.826459852072269 | -0.279 | 0 | 0.022 |
| 3.829601444725859 | -0.275 | 0 | 0.024 |
| 3.832743037379448 | -0.272 | 0 | 0.026 |
| 3.835884630033038 | -0.268 | 0 | 0.028 |
| 3.839026222686627 | -0.265 | 0 | 0.031 |
| 3.842167815340217 | -0.261 | 0 | 0.033 |
| 3.845309407993807 | -0.258 | 0 | 0.036 |
| 3.848451000647396 | -0.254 | 0 | 0.039 |
| 3.851592593300986 | -0.251 | 0 | 0.042 |
| 3.854734185954575 | -0.247 | 0 | 0.045 |
| 3.857875778608165 | -0.244 | 0 | 0.049 |
| 3.861017371261755 | -0.241 | 0 | 0.052 |
| 3.864158963915344 | -0.237 | 0 | 0.056 |
| 3.867300556568933 | -0.234 | 0 | 0.06 |
| 3.870442149222523 | -0.231 | 0 | 0.064 |
| 3.873583741876112 | -0.228 | 0 | 0.069 |
| 3.876725334529703 | -0.225 | 0 | 0.073 |
| 3.879866927183292 | -0.221 | 0 | 0.078 |
| 3.883008519836882 | -0.218 | 0 | 0.083 |
| 3.886150112490471 | -0.215 | 0 | 0.088 |
| 3.889291705144061 | -0.212 | 0 | 0.094 |
| 3.892433297797651 | -0.209 | 0 | 0.099 |
| 3.89557489045124 | -0.206 | 0 | 0.105 |
| 3.89871648310483 | -0.203 | 0 | 0.111 |
| 3.901858075758419 | -0.2 | 0 | 0.118 |
| 3.904999668412009 | -0.197 | 0 | 0.124 |
| 3.908141261065598 | -0.194 | 0 | 0.131 |
| 3.911282853719188 | -0.191 | 0 | 0.138 |
| 3.914424446372778 | -0.188 | 0 | 0.145 |
| 3.917566039026367 | -0.185 | 0 | 0.153 |
| 3.920707631679957 | -0.182 | 0 | 0.161 |
| 3.923849224333547 | -0.18 | 0 | 0.169 |
| 3.926990816987136 | -0.177 | 0 | 0.177 |
| 3.930132409640726 | -0.174 | 0 | 0.185 |
| 3.933274002294315 | -0.171 | 0 | 0.194 |
| 3.936415594947905 | -0.169 | 0 | 0.203 |
| 3.939557187601495 | -0.166 | 0 | 0.212 |
| 3.942698780255084 | -0.163 | 0 | 0.221 |
| 3.945840372908674 | -0.161 | 0 | 0.231 |
| 3.948981965562263 | -0.158 | 0 | 0.241 |
| 3.952123558215853 | -0.155 | 0 | 0.251 |
| 3.955265150869442 | -0.153 | 0 | 0.261 |
| 3.958406743523032 | -0.15 | 0 | 0.272 |
| 3.961548336176622 | -0.148 | 0 | 0.282 |
| 3.964689928830211 | -0.145 | 0 | 0.293 |
| 3.967831521483801 | -0.143 | 0 | 0.304 |
| 3.97097311413739 | -0.14 | 0 | 0.316 |
| 3.97411470679098 | -0.138 | 0 | 0.327 |
| 3.97725629944457 | -0.136 | 0 | 0.339 |
| 3.98039789209816 | -0.133 | 0 | 0.351 |
| 3.983539484751749 | -0.131 | 0 | 0.363 |
| 3.986681077405338 | -0.129 | 0 | 0.375 |
| 3.989822670058928 | -0.126 | 0 | 0.387 |
| 3.992964262712517 | -0.124 | 0 | 0.399 |
| 3.996105855366107 | -0.122 | 0 | 0.412 |
| 3.999247448019697 | -0.12 | 0 | 0.425 |
| 4.002389040673287 | -0.118 | 0 | 0.438 |
| 4.005530633326877 | -0.116 | 0 | 0.451 |
| 4.008672225980466 | -0.113 | 0 | 0.464 |
| 4.011813818634056 | -0.111 | 0 | 0.477 |
| 4.014955411287645 | -0.109 | 0 | 0.49 |
| 4.018097003941234 | -0.107 | 0 | 0.503 |
| 4.021238596594824 | -0.105 | 0 | 0.517 |
| 4.024380189248414 | -0.103 | 0 | 0.53 |
| 4.027521781902004 | -0.101 | 0 | 0.544 |
| 4.030663374555593 | -0.099 | 0 | 0.557 |
| 4.033804967209183 | -0.097 | 0 | 0.571 |
| 4.036946559862773 | -0.096 | 0 | 0.584 |
| 4.040088152516362 | -0.094 | -0.001 | 0.598 |
| 4.043229745169951 | -0.092 | -0.001 | 0.611 |
| 4.046371337823541 | -0.09 | -0.001 | 0.624 |
| 4.049512930477131 | -0.088 | -0.001 | 0.638 |
| 4.05265452313072 | -0.086 | -0.001 | 0.651 |
| 4.05579611578431 | -0.085 | -0.001 | 0.664 |
| 4.0589377084379 | -0.083 | -0.001 | 0.677 |
| 4.062079301091489 | -0.081 | -0.001 | 0.691 |
| 4.065220893745079 | -0.08 | -0.002 | 0.703 |
| 4.068362486398668 | -0.078 | -0.002 | 0.716 |
| 4.071504079052258 | -0.076 | -0.002 | 0.729 |
| 4.074645671705848 | -0.075 | -0.002 | 0.742 |
| 4.077787264359437 | -0.073 | -0.002 | 0.754 |
| 4.080928857013027 | -0.072 | -0.003 | 0.766 |
| 4.084070449666616 | -0.07 | -0.003 | 0.778 |
| 4.087212042320206 | -0.069 | -0.003 | 0.79 |
| 4.090353634973795 | -0.067 | -0.003 | 0.802 |
| 4.093495227627385 | -0.066 | -0.004 | 0.813 |
| 4.096636820280975 | -0.064 | -0.004 | 0.824 |
| 4.099778412934564 | -0.063 | -0.004 | 0.835 |
| 4.102920005588154 | -0.061 | -0.005 | 0.846 |
| 4.106061598241744 | -0.06 | -0.005 | 0.856 |
| 4.109203190895333 | -0.059 | -0.006 | 0.866 |
| 4.112344783548923 | -0.057 | -0.006 | 0.876 |
| 4.115486376202512 | -0.056 | -0.007 | 0.885 |
| 4.118627968856102 | -0.055 | -0.007 | 0.894 |
| 4.121769561509692 | -0.054 | -0.008 | 0.903 |
| 4.124911154163281 | -0.052 | -0.009 | 0.912 |
| 4.128052746816871 | -0.051 | -0.009 | 0.92 |
| 4.13119433947046 | -0.05 | -0.01 | 0.928 |
| 4.13433593212405 | -0.049 | -0.011 | 0.935 |
| 4.13747752477764 | -0.048 | -0.011 | 0.942 |
| 4.14061911743123 | -0.046 | -0.012 | 0.949 |
| 4.143760710084818 | -0.045 | -0.013 | 0.955 |
| 4.146902302738408 | -0.044 | -0.014 | 0.961 |
| 4.150043895391998 | -0.043 | -0.015 | 0.967 |
| 4.153185488045588 | -0.042 | -0.016 | 0.972 |
| 4.156327080699177 | -0.041 | -0.017 | 0.977 |
| 4.159468673352766 | -0.04 | -0.018 | 0.981 |
| 4.162610266006356 | -0.039 | -0.019 | 0.985 |
| 4.165751858659946 | -0.038 | -0.021 | 0.988 |
| 4.168893451313535 | -0.037 | -0.022 | 0.991 |
| 4.172035043967125 | -0.036 | -0.023 | 0.994 |
| 4.175176636620715 | -0.035 | -0.024 | 0.996 |
| 4.178318229274304 | -0.034 | -0.026 | 0.998 |
| 4.181459821927894 | -0.033 | -0.027 | 0.999 |
| 4.184601414581484 | -0.032 | -0.029 | 1 |
| 4.187743007235073 | -0.032 | -0.031 | 1 |
| 4.190884599888663 | -0.031 | -0.032 | 1 |
| 4.194026192542252 | -0.03 | -0.034 | 0.999 |
| 4.197167785195842 | -0.029 | -0.036 | 0.998 |
| 4.200309377849432 | -0.028 | -0.038 | 0.997 |
| 4.203450970503021 | -0.027 | -0.04 | 0.995 |
| 4.206592563156611 | -0.027 | -0.042 | 0.993 |
| 4.2097341558102 | -0.026 | -0.044 | 0.99 |
| 4.21287574846379 | -0.025 | -0.046 | 0.987 |
| 4.21601734111738 | -0.024 | -0.049 | 0.983 |
| 4.21915893377097 | -0.024 | -0.051 | 0.979 |
| 4.222300526424559 | -0.023 | -0.054 | 0.975 |
| 4.225442119078148 | -0.022 | -0.056 | 0.97 |
| 4.228583711731738 | -0.022 | -0.059 | 0.965 |
| 4.231725304385327 | -0.021 | -0.061 | 0.959 |
| 4.234866897038917 | -0.021 | -0.064 | 0.953 |
| 4.238008489692506 | -0.02 | -0.067 | 0.947 |
| 4.241150082346096 | -0.019 | -0.07 | 0.94 |
| 4.244291674999685 | -0.019 | -0.073 | 0.933 |
| 4.247433267653276 | -0.018 | -0.076 | 0.925 |
| 4.250574860306865 | -0.018 | -0.08 | 0.917 |
| 4.253716452960455 | -0.017 | -0.083 | 0.909 |
| 4.256858045614044 | -0.016 | -0.086 | 0.9 |
| 4.259999638267634 | -0.016 | -0.09 | 0.891 |
| 4.263141230921224 | -0.015 | -0.094 | 0.882 |
| 4.266282823574813 | -0.015 | -0.097 | 0.873 |
| 4.269424416228403 | -0.014 | -0.101 | 0.863 |
| 4.272566008881992 | -0.014 | -0.105 | 0.852 |
| 4.275707601535582 | -0.014 | -0.109 | 0.842 |
| 4.27884919418917 | -0.013 | -0.113 | 0.831 |
| 4.28199078684276 | -0.013 | -0.118 | 0.82 |
| 4.285132379496351 | -0.012 | -0.122 | 0.809 |
| 4.28827397214994 | -0.012 | -0.126 | 0.798 |
| 4.29141556480353 | -0.011 | -0.131 | 0.786 |
| 4.294557157457119 | -0.011 | -0.136 | 0.774 |
| 4.29769875011071 | -0.011 | -0.14 | 0.762 |
| 4.300840342764299 | -0.01 | -0.145 | 0.75 |
| 4.303981935417888 | -0.01 | -0.15 | 0.737 |
| 4.307123528071478 | -0.01 | -0.155 | 0.725 |
| 4.310265120725067 | -0.009 | -0.161 | 0.712 |
| 4.313406713378657 | -0.009 | -0.166 | 0.699 |
| 4.316548306032247 | -0.009 | -0.171 | 0.686 |
| 4.319689898685836 | -0.008 | -0.177 | 0.673 |
| 4.322831491339426 | -0.008 | -0.182 | 0.66 |
| 4.325973083993015 | -0.008 | -0.188 | 0.647 |
| 4.329114676646605 | -0.007 | -0.194 | 0.633 |
| 4.332256269300195 | -0.007 | -0.2 | 0.62 |
| 4.335397861953784 | -0.007 | -0.206 | 0.606 |
| 4.338539454607374 | -0.006 | -0.212 | 0.593 |
| 4.341681047260963 | -0.006 | -0.218 | 0.58 |
| 4.344822639914553 | -0.006 | -0.225 | 0.566 |
| 4.347964232568143 | -0.006 | -0.231 | 0.553 |
| 4.351105825221732 | -0.006 | -0.237 | 0.539 |
| 4.354247417875322 | -0.005 | -0.244 | 0.526 |
| 4.357389010528911 | -0.005 | -0.251 | 0.512 |
| 4.360530603182501 | -0.005 | -0.258 | 0.499 |
| 4.36367219583609 | -0.005 | -0.265 | 0.486 |
| 4.36681378848968 | -0.004 | -0.272 | 0.472 |
| 4.36995538114327 | -0.004 | -0.279 | 0.459 |
| 4.373096973796859 | -0.004 | -0.286 | 0.446 |
| 4.376238566450449 | -0.004 | -0.293 | 0.433 |
| 4.379380159104038 | -0.004 | -0.301 | 0.421 |
| 4.382521751757628 | -0.004 | -0.308 | 0.408 |
| 4.385663344411217 | -0.003 | -0.316 | 0.395 |
| 4.388804937064807 | -0.003 | -0.323 | 0.383 |
| 4.391946529718397 | -0.003 | -0.331 | 0.371 |
| 4.395088122371987 | -0.003 | -0.339 | 0.359 |
| 4.398229715025576 | -0.003 | -0.347 | 0.347 |
| 4.401371307679165 | -0.003 | -0.355 | 0.335 |
| 4.404512900332755 | -0.003 | -0.363 | 0.323 |
| 4.407654492986345 | -0.002 | -0.371 | 0.312 |
| 4.410796085639934 | -0.002 | -0.379 | 0.301 |
| 4.413937678293524 | -0.002 | -0.387 | 0.29 |
| 4.417079270947114 | -0.002 | -0.395 | 0.279 |
| 4.420220863600703 | -0.002 | -0.404 | 0.268 |
| 4.423362456254293 | -0.002 | -0.412 | 0.258 |
| 4.426504048907883 | -0.002 | -0.421 | 0.247 |
| 4.429645641561472 | -0.002 | -0.429 | 0.237 |
| 4.432787234215062 | -0.002 | -0.438 | 0.228 |
| 4.435928826868651 | -0.002 | -0.446 | 0.218 |
| 4.43907041952224 | -0.001 | -0.455 | 0.209 |
| 4.44221201217583 | -0.001 | -0.464 | 0.2 |
| 4.44535360482942 | -0.001 | -0.472 | 0.191 |
| 4.44849519748301 | -0.001 | -0.481 | 0.182 |
| 4.4516367901366 | -0.001 | -0.49 | 0.174 |
| 4.454778382790188 | -0.001 | -0.499 | 0.166 |
| 4.457919975443779 | -0.001 | -0.508 | 0.158 |
| 4.461061568097368 | -0.001 | -0.517 | 0.15 |
| 4.464203160750958 | -0.001 | -0.526 | 0.143 |
| 4.467344753404547 | -0.001 | -0.535 | 0.136 |
| 4.470486346058137 | -0.001 | -0.544 | 0.129 |
| 4.473627938711726 | -0.001 | -0.553 | 0.122 |
| 4.476769531365316 | -0.001 | -0.562 | 0.116 |
| 4.479911124018905 | -0.001 | -0.571 | 0.109 |
| 4.483052716672495 | -0.001 | -0.58 | 0.103 |
| 4.486194309326085 | -0.001 | -0.589 | 0.097 |
| 4.489335901979674 | -0.001 | -0.598 | 0.092 |
| 4.492477494633264 | 0 | -0.606 | 0.086 |
| 4.495619087286854 | 0 | -0.615 | 0.081 |
| 4.498760679940443 | 0 | -0.624 | 0.076 |
| 4.501902272594033 | 0 | -0.633 | 0.072 |
| 4.505043865247622 | 0 | -0.642 | 0.067 |
| 4.508185457901212 | 0 | -0.651 | 0.063 |
| 4.511327050554801 | 0 | -0.66 | 0.059 |
| 4.514468643208391 | 0 | -0.669 | 0.055 |
| 4.517610235861981 | 0 | -0.677 | 0.051 |
| 4.520751828515571 | 0 | -0.686 | 0.048 |
| 4.52389342116916 | 0 | -0.695 | 0.044 |
| 4.52703501382275 | 0 | -0.703 | 0.041 |
| 4.530176606476339 | 0 | -0.712 | 0.038 |
| 4.533318199129928 | 0 | -0.721 | 0.035 |
| 4.536459791783518 | 0 | -0.729 | 0.032 |
| 4.539601384437108 | 0 | -0.737 | 0.03 |
| 4.542742977090698 | 0 | -0.746 | 0.027 |
| 4.545884569744287 | 0 | -0.754 | 0.025 |
| 4.549026162397876 | 0 | -0.762 | 0.023 |
| 4.552167755051466 | 0 | -0.77 | 0.021 |
| 4.555309347705056 | 0 | -0.778 | 0.019 |
| 4.558450940358646 | 0 | -0.786 | 0.018 |
| 4.561592533012235 | 0 | -0.794 | 0.016 |
| 4.564734125665825 | 0 | -0.802 | 0.014 |
| 4.567875718319415 | 0 | -0.809 | 0.013 |
| 4.571017310973004 | 0 | -0.817 | 0.012 |
| 4.574158903626594 | 0 | -0.824 | 0.011 |
| 4.577300496280183 | 0 | -0.831 | 0.01 |
| 4.580442088933772 | 0 | -0.838 | 0.009 |
| 4.583583681587362 | 0 | -0.846 | 0.008 |
| 4.586725274240952 | 0 | -0.852 | 0.007 |
| 4.589866866894542 | 0 | -0.859 | 0.006 |
| 4.593008459548131 | 0 | -0.866 | 0.005 |
| 4.596150052201721 | 0 | -0.873 | 0.005 |
| 4.59929164485531 | 0 | -0.879 | 0.004 |
| 4.6024332375089 | 0 | -0.885 | 0.004 |
| 4.60557483016249 | 0 | -0.891 | 0.003 |
| 4.608716422816079 | 0 | -0.897 | 0.003 |
| 4.611858015469668 | 0 | -0.903 | 0.002 |
| 4.614999608123258 | 0 | -0.909 | 0.002 |
| 4.618141200776848 | 0 | -0.915 | 0.002 |
| 4.621282793430437 | 0 | -0.92 | 0.001 |
| 4.624424386084027 | 0 | -0.925 | 0.001 |
| 4.627565978737617 | 0 | -0.93 | 0.001 |
| 4.630707571391206 | 0 | -0.935 | 0.001 |
| 4.633849164044795 | 0 | -0.94 | 0.001 |
| 4.636990756698386 | 0 | -0.945 | 0.001 |
| 4.640132349351975 | 0 | -0.949 | 0 |
| 4.643273942005564 | 0 | -0.953 | 0 |
| 4.646415534659154 | 0 | -0.957 | 0 |
| 4.649557127312744 | 0 | -0.961 | 0 |
| 4.652698719966334 | 0 | -0.965 | 0 |
| 4.655840312619923 | 0 | -0.968 | 0 |
| 4.658981905273513 | 0 | -0.972 | 0 |
| 4.662123497927102 | 0 | -0.975 | 0 |
| 4.665265090580692 | 0 | -0.978 | 0 |
| 4.668406683234282 | 0 | -0.981 | 0 |
| 4.671548275887871 | 0 | -0.983 | 0 |
| 4.674689868541461 | 0 | -0.986 | 0 |
| 4.67783146119505 | 0 | -0.988 | 0 |
| 4.68097305384864 | 0 | -0.99 | 0 |
| 4.68411464650223 | 0 | -0.992 | 0 |
| 4.687256239155819 | 0 | -0.994 | 0 |
| 4.690397831809409 | 0 | -0.995 | 0 |
| 4.693539424462998 | 0 | -0.996 | 0 |
| 4.696681017116588 | 0 | -0.998 | 0 |
| 4.699822609770177 | 0 | -0.998 | 0 |
| 4.702964202423767 | 0 | -0.999 | 0 |
| 4.706105795077356 | 0 | -1 | 0 |
| 4.709247387730946 | 0 | -1 | 0 |
| 4.712388980384535 | 0 | -1 | 0 |
| 4.715530573038126 | 0 | -1 | 0 |
| 4.718672165691715 | 0 | -1 | 0 |
| 4.721813758345305 | 0 | -0.999 | 0 |
| 4.724955350998894 | 0 | -0.998 | 0 |
| 4.728096943652484 | 0 | -0.998 | 0 |
| 4.731238536306074 | 0 | -0.996 | 0 |
| 4.734380128959663 | 0 | -0.995 | 0 |
| 4.737521721613253 | 0 | -0.994 | 0 |
| 4.740663314266842 | 0 | -0.992 | 0 |
| 4.743804906920432 | 0 | -0.99 | 0 |
| 4.74694649957402 | 0 | -0.988 | 0 |
| 4.750088092227611 | 0 | -0.986 | 0 |
| 4.7532296848812 | 0 | -0.983 | 0 |
| 4.75637127753479 | 0 | -0.981 | 0 |
| 4.75951287018838 | 0 | -0.978 | 0 |
| 4.76265446284197 | 0 | -0.975 | 0 |
| 4.765796055495559 | 0 | -0.972 | 0 |
| 4.768937648149149 | 0 | -0.968 | 0 |
| 4.772079240802738 | 0 | -0.965 | 0 |
| 4.775220833456327 | 0 | -0.961 | 0 |
| 4.778362426109917 | 0 | -0.957 | 0 |
| 4.781504018763507 | 0 | -0.953 | 0 |
| 4.784645611417097 | 0 | -0.949 | 0 |
| 4.787787204070686 | 0 | -0.945 | -0.001 |
| 4.790928796724275 | 0 | -0.94 | -0.001 |
| 4.794070389377865 | 0 | -0.935 | -0.001 |
| 4.797211982031455 | 0 | -0.93 | -0.001 |
| 4.800353574685045 | 0 | -0.925 | -0.001 |
| 4.803495167338634 | 0 | -0.92 | -0.001 |
| 4.806636759992224 | 0 | -0.915 | -0.002 |
| 4.809778352645814 | 0 | -0.909 | -0.002 |
| 4.812919945299403 | 0 | -0.903 | -0.002 |
| 4.816061537952993 | 0 | -0.897 | -0.003 |
| 4.819203130606582 | 0 | -0.891 | -0.003 |
| 4.822344723260172 | 0 | -0.885 | -0.004 |
| 4.825486315913761 | 0 | -0.879 | -0.004 |
| 4.828627908567351 | 0 | -0.873 | -0.005 |
| 4.83176950122094 | 0 | -0.866 | -0.005 |
| 4.83491109387453 | 0 | -0.859 | -0.006 |
| 4.83805268652812 | 0 | -0.852 | -0.007 |
| 4.841194279181709 | 0 | -0.846 | -0.008 |
| 4.844335871835299 | 0 | -0.838 | -0.009 |
| 4.847477464488889 | 0 | -0.831 | -0.01 |
| 4.850619057142478 | 0 | -0.824 | -0.011 |
| 4.853760649796068 | 0 | -0.817 | -0.012 |
| 4.856902242449657 | 0 | -0.809 | -0.013 |
| 4.860043835103247 | 0 | -0.802 | -0.014 |
| 4.863185427756837 | 0 | -0.794 | -0.016 |
| 4.866327020410426 | 0 | -0.786 | -0.018 |
| 4.869468613064015 | 0 | -0.778 | -0.019 |
| 4.872610205717605 | 0 | -0.77 | -0.021 |
| 4.875751798371195 | 0 | -0.762 | -0.023 |
| 4.878893391024784 | 0 | -0.754 | -0.025 |
| 4.882034983678374 | 0 | -0.746 | -0.027 |
| 4.885176576331964 | 0 | -0.737 | -0.03 |
| 4.888318168985553 | 0 | -0.729 | -0.032 |
| 4.891459761639143 | 0 | -0.721 | -0.035 |
| 4.894601354292733 | 0 | -0.712 | -0.038 |
| 4.897742946946322 | 0 | -0.703 | -0.041 |
| 4.900884539599912 | 0 | -0.695 | -0.044 |
| 4.904026132253501 | 0 | -0.686 | -0.048 |
| 4.907167724907091 | 0 | -0.677 | -0.051 |
| 4.91030931756068 | 0 | -0.669 | -0.055 |
| 4.91345091021427 | 0 | -0.66 | -0.059 |
| 4.91659250286786 | 0 | -0.651 | -0.063 |
| 4.91973409552145 | 0 | -0.642 | -0.067 |
| 4.922875688175039 | 0 | -0.633 | -0.072 |
| 4.926017280828628 | 0 | -0.624 | -0.076 |
| 4.929158873482218 | 0 | -0.615 | -0.081 |
| 4.932300466135808 | 0 | -0.606 | -0.086 |
| 4.935442058789397 | 0.001 | -0.598 | -0.092 |
| 4.938583651442987 | 0.001 | -0.589 | -0.097 |
| 4.941725244096576 | 0.001 | -0.58 | -0.103 |
| 4.944866836750166 | 0.001 | -0.571 | -0.109 |
| 4.948008429403755 | 0.001 | -0.562 | -0.116 |
| 4.951150022057345 | 0.001 | -0.553 | -0.122 |
| 4.954291614710935 | 0.001 | -0.544 | -0.129 |
| 4.957433207364524 | 0.001 | -0.535 | -0.136 |
| 4.960574800018114 | 0.001 | -0.526 | -0.143 |
| 4.963716392671704 | 0.001 | -0.517 | -0.15 |
| 4.966857985325293 | 0.001 | -0.508 | -0.158 |
| 4.969999577978883 | 0.001 | -0.499 | -0.166 |
| 4.973141170632472 | 0.001 | -0.49 | -0.174 |
| 4.976282763286062 | 0.001 | -0.481 | -0.182 |
| 4.979424355939651 | 0.001 | -0.472 | -0.191 |
| 4.982565948593241 | 0.001 | -0.464 | -0.2 |
| 4.985707541246831 | 0.001 | -0.455 | -0.209 |
| 4.98884913390042 | 0.002 | -0.446 | -0.218 |
| 4.99199072655401 | 0.002 | -0.438 | -0.228 |
| 4.9951323192076 | 0.002 | -0.429 | -0.237 |
| 4.99827391186119 | 0.002 | -0.421 | -0.247 |
| 5.00141550451478 | 0.002 | -0.412 | -0.258 |
| 5.004557097168369 | 0.002 | -0.404 | -0.268 |
| 5.007698689821958 | 0.002 | -0.395 | -0.279 |
| 5.010840282475548 | 0.002 | -0.387 | -0.29 |
| 5.013981875129137 | 0.002 | -0.379 | -0.301 |
| 5.017123467782727 | 0.002 | -0.371 | -0.312 |
| 5.020265060436317 | 0.003 | -0.363 | -0.323 |
| 5.023406653089906 | 0.003 | -0.355 | -0.335 |
| 5.026548245743496 | 0.003 | -0.347 | -0.347 |
| 5.029689838397085 | 0.003 | -0.339 | -0.359 |
| 5.032831431050674 | 0.003 | -0.331 | -0.371 |
| 5.035973023704264 | 0.003 | -0.323 | -0.383 |
| 5.039114616357854 | 0.003 | -0.316 | -0.395 |
| 5.042256209011444 | 0.004 | -0.308 | -0.408 |
| 5.045397801665033 | 0.004 | -0.301 | -0.421 |
| 5.048539394318622 | 0.004 | -0.293 | -0.433 |
| 5.051680986972213 | 0.004 | -0.286 | -0.446 |
| 5.054822579625802 | 0.004 | -0.279 | -0.459 |
| 5.057964172279392 | 0.004 | -0.272 | -0.472 |
| 5.061105764932981 | 0.005 | -0.265 | -0.486 |
| 5.064247357586571 | 0.005 | -0.258 | -0.499 |
| 5.067388950240161 | 0.005 | -0.251 | -0.512 |
| 5.07053054289375 | 0.005 | -0.244 | -0.526 |
| 5.07367213554734 | 0.006 | -0.237 | -0.539 |
| 5.07681372820093 | 0.006 | -0.231 | -0.553 |
| 5.079955320854519 | 0.006 | -0.225 | -0.566 |
| 5.083096913508108 | 0.006 | -0.218 | -0.58 |
| 5.086238506161698 | 0.006 | -0.212 | -0.593 |
| 5.089380098815288 | 0.007 | -0.206 | -0.606 |
| 5.092521691468877 | 0.007 | -0.2 | -0.62 |
| 5.095663284122466 | 0.007 | -0.194 | -0.633 |
| 5.098804876776057 | 0.008 | -0.188 | -0.647 |
| 5.101946469429646 | 0.008 | -0.182 | -0.66 |
| 5.105088062083236 | 0.008 | -0.177 | -0.673 |
| 5.108229654736825 | 0.009 | -0.171 | -0.686 |
| 5.111371247390415 | 0.009 | -0.166 | -0.699 |
| 5.114512840044005 | 0.009 | -0.161 | -0.712 |
| 5.117654432697594 | 0.01 | -0.155 | -0.725 |
| 5.120796025351184 | 0.01 | -0.15 | -0.737 |
| 5.123937618004773 | 0.01 | -0.145 | -0.75 |
| 5.127079210658363 | 0.011 | -0.14 | -0.762 |
| 5.130220803311953 | 0.011 | -0.136 | -0.774 |
| 5.133362395965542 | 0.011 | -0.131 | -0.786 |
| 5.136503988619131 | 0.012 | -0.126 | -0.798 |
| 5.13964558127272 | 0.012 | -0.122 | -0.809 |
| 5.142787173926311 | 0.013 | -0.118 | -0.82 |
| 5.1459287665799 | 0.013 | -0.113 | -0.831 |
| 5.14907035923349 | 0.014 | -0.109 | -0.842 |
| 5.15221195188708 | 0.014 | -0.105 | -0.852 |
| 5.15535354454067 | 0.014 | -0.101 | -0.863 |
| 5.158495137194259 | 0.015 | -0.097 | -0.873 |
| 5.161636729847848 | 0.015 | -0.094 | -0.882 |
| 5.164778322501438 | 0.016 | -0.09 | -0.891 |
| 5.167919915155028 | 0.016 | -0.086 | -0.9 |
| 5.171061507808617 | 0.017 | -0.083 | -0.909 |
| 5.174203100462206 | 0.018 | -0.08 | -0.917 |
| 5.177344693115796 | 0.018 | -0.076 | -0.925 |
| 5.180486285769386 | 0.019 | -0.073 | -0.933 |
| 5.183627878422976 | 0.019 | -0.07 | -0.94 |
| 5.186769471076565 | 0.02 | -0.067 | -0.947 |
| 5.189911063730155 | 0.021 | -0.064 | -0.953 |
| 5.193052656383744 | 0.021 | -0.061 | -0.959 |
| 5.196194249037334 | 0.022 | -0.059 | -0.965 |
| 5.199335841690924 | 0.022 | -0.056 | -0.97 |
| 5.202477434344513 | 0.023 | -0.054 | -0.975 |
| 5.205619026998103 | 0.024 | -0.051 | -0.979 |
| 5.208760619651692 | 0.024 | -0.049 | -0.983 |
| 5.211902212305282 | 0.025 | -0.046 | -0.987 |
| 5.215043804958871 | 0.026 | -0.044 | -0.99 |
| 5.218185397612461 | 0.027 | -0.042 | -0.993 |
| 5.221326990266051 | 0.027 | -0.04 | -0.995 |
| 5.22446858291964 | 0.028 | -0.038 | -0.997 |
| 5.22761017557323 | 0.029 | -0.036 | -0.998 |
| 5.23075176822682 | 0.03 | -0.034 | -0.999 |
| 5.23389336088041 | 0.031 | -0.032 | -1 |
| 5.237034953533999 | 0.032 | -0.031 | -1 |
| 5.240176546187588 | 0.032 | -0.029 | -1 |
| 5.243318138841178 | 0.033 | -0.027 | -0.999 |
| 5.246459731494767 | 0.034 | -0.026 | -0.998 |
| 5.249601324148357 | 0.035 | -0.024 | -0.996 |
| 5.252742916801947 | 0.036 | -0.023 | -0.994 |
| 5.255884509455536 | 0.037 | -0.022 | -0.991 |
| 5.259026102109125 | 0.038 | -0.021 | -0.988 |
| 5.262167694762715 | 0.039 | -0.019 | -0.985 |
| 5.265309287416305 | 0.04 | -0.018 | -0.981 |
| 5.268450880069895 | 0.041 | -0.017 | -0.977 |
| 5.271592472723484 | 0.042 | -0.016 | -0.972 |
| 5.274734065377074 | 0.043 | -0.015 | -0.967 |
| 5.277875658030664 | 0.044 | -0.014 | -0.961 |
| 5.281017250684253 | 0.045 | -0.013 | -0.955 |
| 5.284158843337843 | 0.046 | -0.012 | -0.949 |
| 5.287300435991432 | 0.048 | -0.011 | -0.942 |
| 5.290442028645022 | 0.049 | -0.011 | -0.935 |
| 5.293583621298612 | 0.05 | -0.01 | -0.928 |
| 5.296725213952201 | 0.051 | -0.009 | -0.92 |
| 5.299866806605791 | 0.052 | -0.009 | -0.912 |
| 5.30300839925938 | 0.054 | -0.008 | -0.903 |
| 5.30614999191297 | 0.055 | -0.007 | -0.894 |
| 5.30929158456656 | 0.056 | -0.007 | -0.885 |
| 5.312433177220149 | 0.057 | -0.006 | -0.876 |
| 5.315574769873739 | 0.059 | -0.006 | -0.866 |
| 5.318716362527328 | 0.06 | -0.005 | -0.856 |
| 5.321857955180918 | 0.061 | -0.005 | -0.846 |
| 5.324999547834508 | 0.063 | -0.004 | -0.835 |
| 5.328141140488097 | 0.064 | -0.004 | -0.824 |
| 5.331282733141686 | 0.066 | -0.004 | -0.813 |
| 5.334424325795276 | 0.067 | -0.003 | -0.802 |
| 5.337565918448866 | 0.069 | -0.003 | -0.79 |
| 5.340707511102456 | 0.07 | -0.003 | -0.778 |
| 5.343849103756045 | 0.072 | -0.003 | -0.766 |
| 5.346990696409634 | 0.073 | -0.002 | -0.754 |
| 5.350132289063224 | 0.075 | -0.002 | -0.742 |
| 5.353273881716814 | 0.076 | -0.002 | -0.729 |
| 5.356415474370403 | 0.078 | -0.002 | -0.716 |
| 5.359557067023993 | 0.08 | -0.002 | -0.703 |
| 5.362698659677583 | 0.081 | -0.001 | -0.691 |
| 5.365840252331172 | 0.083 | -0.001 | -0.677 |
| 5.368981844984762 | 0.085 | -0.001 | -0.664 |
| 5.372123437638351 | 0.086 | -0.001 | -0.651 |
| 5.375265030291941 | 0.088 | -0.001 | -0.638 |
| 5.378406622945531 | 0.09 | -0.001 | -0.624 |
| 5.38154821559912 | 0.092 | -0.001 | -0.611 |
| 5.38468980825271 | 0.094 | -0.001 | -0.598 |
| 5.387831400906299 | 0.096 | 0 | -0.584 |
| 5.39097299355989 | 0.097 | 0 | -0.571 |
| 5.394114586213479 | 0.099 | 0 | -0.557 |
| 5.397256178867068 | 0.101 | 0 | -0.544 |
| 5.400397771520657 | 0.103 | 0 | -0.53 |
| 5.403539364174247 | 0.105 | 0 | -0.517 |
| 5.406680956827837 | 0.107 | 0 | -0.503 |
| 5.409822549481426 | 0.109 | 0 | -0.49 |
| 5.412964142135016 | 0.111 | 0 | -0.477 |
| 5.416105734788605 | 0.113 | 0 | -0.464 |
| 5.419247327442195 | 0.116 | 0 | -0.451 |
| 5.422388920095785 | 0.118 | 0 | -0.438 |
| 5.425530512749375 | 0.12 | 0 | -0.425 |
| 5.428672105402964 | 0.122 | 0 | -0.412 |
| 5.431813698056554 | 0.124 | 0 | -0.399 |
| 5.434955290710143 | 0.126 | 0 | -0.387 |
| 5.438096883363733 | 0.129 | 0 | -0.375 |
| 5.441238476017322 | 0.131 | 0 | -0.363 |
| 5.444380068670912 | 0.133 | 0 | -0.351 |
| 5.447521661324502 | 0.136 | 0 | -0.339 |
| 5.450663253978091 | 0.138 | 0 | -0.327 |
| 5.453804846631681 | 0.14 | 0 | -0.316 |
| 5.456946439285271 | 0.143 | 0 | -0.304 |
| 5.46008803193886 | 0.145 | 0 | -0.293 |
| 5.46322962459245 | 0.148 | 0 | -0.282 |
| 5.466371217246039 | 0.15 | 0 | -0.272 |
| 5.46951280989963 | 0.153 | 0 | -0.261 |
| 5.472654402553218 | 0.155 | 0 | -0.251 |
| 5.475795995206808 | 0.158 | 0 | -0.241 |
| 5.478937587860398 | 0.161 | 0 | -0.231 |
| 5.482079180513987 | 0.163 | 0 | -0.221 |
| 5.485220773167577 | 0.166 | 0 | -0.212 |
| 5.488362365821166 | 0.169 | 0 | -0.203 |
| 5.491503958474756 | 0.171 | 0 | -0.194 |
| 5.494645551128346 | 0.174 | 0 | -0.185 |
| 5.497787143781935 | 0.177 | 0 | -0.177 |
| 5.500928736435525 | 0.18 | 0 | -0.169 |
| 5.504070329089115 | 0.182 | 0 | -0.161 |
| 5.507211921742704 | 0.185 | 0 | -0.153 |
| 5.510353514396294 | 0.188 | 0 | -0.145 |
| 5.513495107049883 | 0.191 | 0 | -0.138 |
| 5.516636699703473 | 0.194 | 0 | -0.131 |
| 5.519778292357062 | 0.197 | 0 | -0.124 |
| 5.522919885010652 | 0.2 | 0 | -0.118 |
| 5.526061477664242 | 0.203 | 0 | -0.111 |
| 5.529203070317831 | 0.206 | 0 | -0.105 |
| 5.532344662971421 | 0.209 | 0 | -0.099 |
| 5.535486255625011 | 0.212 | 0 | -0.094 |
| 5.5386278482786 | 0.215 | 0 | -0.088 |
| 5.54176944093219 | 0.218 | 0 | -0.083 |
| 5.544911033585779 | 0.221 | 0 | -0.078 |
| 5.54805262623937 | 0.225 | 0 | -0.073 |
| 5.551194218892959 | 0.228 | 0 | -0.069 |
| 5.554335811546548 | 0.231 | 0 | -0.064 |
| 5.557477404200137 | 0.234 | 0 | -0.06 |
| 5.560618996853727 | 0.237 | 0 | -0.056 |
| 5.563760589507317 | 0.241 | 0 | -0.052 |
| 5.566902182160906 | 0.244 | 0 | -0.049 |
| 5.570043774814496 | 0.247 | 0 | -0.045 |
| 5.573185367468086 | 0.251 | 0 | -0.042 |
| 5.576326960121675 | 0.254 | 0 | -0.039 |
| 5.579468552775264 | 0.258 | 0 | -0.036 |
| 5.582610145428854 | 0.261 | 0 | -0.033 |
| 5.585751738082444 | 0.265 | 0 | -0.031 |
| 5.588893330736034 | 0.268 | 0 | -0.028 |
| 5.592034923389623 | 0.272 | 0 | -0.026 |
| 5.595176516043213 | 0.275 | 0 | -0.024 |
| 5.598318108696803 | 0.279 | 0 | -0.022 |
| 5.601459701350392 | 0.282 | 0 | -0.02 |
| 5.604601294003982 | 0.286 | 0 | -0.018 |
| 5.607742886657571 | 0.29 | 0 | -0.016 |
| 5.610884479311161 | 0.293 | 0.001 | -0.015 |
| 5.61402607196475 | 0.297 | 0.001 | -0.014 |
| 5.61716766461834 | 0.301 | 0.001 | -0.012 |
| 5.62030925727193 | 0.304 | 0.001 | -0.011 |
| 5.623450849925519 | 0.308 | 0.001 | -0.01 |
| 5.626592442579109 | 0.312 | 0.001 | -0.009 |
| 5.629734035232698 | 0.316 | 0.001 | -0.008 |
| 5.632875627886288 | 0.319 | 0.001 | -0.007 |
| 5.636017220539878 | 0.323 | 0.002 | -0.006 |
| 5.639158813193467 | 0.327 | 0.002 | -0.006 |
| 5.642300405847057 | 0.331 | 0.002 | -0.005 |
| 5.645441998500646 | 0.335 | 0.002 | -0.004 |
| 5.648583591154236 | 0.339 | 0.002 | -0.004 |
| 5.651725183807825 | 0.343 | 0.003 | -0.003 |
| 5.654866776461415 | 0.347 | 0.003 | -0.003 |
| 5.658008369115005 | 0.351 | 0.003 | -0.002 |
| 5.661149961768594 | 0.355 | 0.003 | -0.002 |
| 5.664291554422184 | 0.359 | 0.004 | -0.002 |
| 5.667433147075774 | 0.363 | 0.004 | -0.002 |
| 5.670574739729363 | 0.367 | 0.004 | -0.001 |
| 5.673716332382953 | 0.371 | 0.005 | -0.001 |
| 5.676857925036542 | 0.375 | 0.005 | -0.001 |
| 5.679999517690132 | 0.379 | 0.006 | -0.001 |
| 5.683141110343721 | 0.383 | 0.006 | -0.001 |
| 5.686282702997311 | 0.387 | 0.007 | 0 |
| 5.689424295650901 | 0.391 | 0.007 | 0 |
| 5.69256588830449 | 0.395 | 0.008 | 0 |
| 5.69570748095808 | 0.399 | 0.009 | 0 |
| 5.69884907361167 | 0.404 | 0.009 | 0 |
| 5.701990666265259 | 0.408 | 0.01 | 0 |
| 5.705132258918849 | 0.412 | 0.011 | 0 |
| 5.708273851572438 | 0.416 | 0.011 | 0 |
| 5.711415444226028 | 0.421 | 0.012 | 0 |
| 5.714557036879618 | 0.425 | 0.013 | 0 |
| 5.717698629533207 | 0.429 | 0.014 | 0 |
| 5.720840222186797 | 0.433 | 0.015 | 0 |
| 5.723981814840386 | 0.438 | 0.016 | 0 |
| 5.727123407493976 | 0.442 | 0.017 | 0 |
| 5.730265000147565 | 0.446 | 0.018 | 0 |
| 5.733406592801155 | 0.451 | 0.019 | 0 |
| 5.736548185454744 | 0.455 | 0.021 | 0 |
| 5.739689778108334 | 0.459 | 0.022 | 0 |
| 5.742831370761924 | 0.464 | 0.023 | 0 |
| 5.745972963415514 | 0.468 | 0.024 | 0 |
| 5.749114556069103 | 0.472 | 0.026 | 0 |
| 5.752256148722693 | 0.477 | 0.027 | 0 |
| 5.755397741376282 | 0.481 | 0.029 | 0 |
| 5.758539334029872 | 0.486 | 0.031 | 0 |
| 5.761680926683462 | 0.49 | 0.032 | 0 |
| 5.764822519337051 | 0.495 | 0.034 | 0 |
| 5.767964111990641 | 0.499 | 0.036 | 0 |
| 5.77110570464423 | 0.503 | 0.038 | 0 |
| 5.77424729729782 | 0.508 | 0.04 | 0 |
| 5.77738888995141 | 0.512 | 0.042 | 0 |
| 5.780530482605 | 0.517 | 0.044 | 0 |
| 5.783672075258588 | 0.521 | 0.046 | 0 |
| 5.786813667912178 | 0.526 | 0.049 | 0 |
| 5.789955260565768 | 0.53 | 0.051 | 0 |
| 5.793096853219358 | 0.535 | 0.054 | 0 |
| 5.796238445872947 | 0.539 | 0.056 | 0 |
| 5.799380038526537 | 0.544 | 0.059 | 0 |
| 5.802521631180126 | 0.548 | 0.061 | 0 |
| 5.805663223833715 | 0.553 | 0.064 | 0 |
| 5.808804816487306 | 0.557 | 0.067 | 0 |
| 5.811946409140895 | 0.562 | 0.07 | 0 |
| 5.815088001794485 | 0.566 | 0.073 | 0 |
| 5.818229594448074 | 0.571 | 0.076 | 0 |
| 5.821371187101663 | 0.575 | 0.08 | 0 |
| 5.824512779755254 | 0.58 | 0.083 | 0 |
| 5.827654372408843 | 0.584 | 0.086 | 0 |
| 5.830795965062433 | 0.589 | 0.09 | 0 |
| 5.833937557716022 | 0.593 | 0.094 | 0.001 |
| 5.837079150369612 | 0.598 | 0.097 | 0.001 |
| 5.840220743023201 | 0.602 | 0.101 | 0.001 |
| 5.843362335676791 | 0.606 | 0.105 | 0.001 |
| 5.846503928330381 | 0.611 | 0.109 | 0.001 |
| 5.84964552098397 | 0.615 | 0.113 | 0.001 |
| 5.85278711363756 | 0.62 | 0.118 | 0.002 |
| 5.85592870629115 | 0.624 | 0.122 | 0.002 |
| 5.85907029894474 | 0.629 | 0.126 | 0.002 |
| 5.862211891598329 | 0.633 | 0.131 | 0.003 |
| 5.865353484251918 | 0.638 | 0.136 | 0.003 |
| 5.868495076905508 | 0.642 | 0.14 | 0.003 |
| 5.871636669559098 | 0.647 | 0.145 | 0.004 |
| 5.874778262212687 | 0.651 | 0.15 | 0.004 |
| 5.877919854866277 | 0.655 | 0.155 | 0.005 |
| 5.881061447519866 | 0.66 | 0.161 | 0.006 |
| 5.884203040173456 | 0.664 | 0.166 | 0.006 |
| 5.887344632827046 | 0.669 | 0.171 | 0.007 |
| 5.890486225480635 | 0.673 | 0.177 | 0.008 |
| 5.893627818134224 | 0.677 | 0.182 | 0.009 |
| 5.896769410787814 | 0.682 | 0.188 | 0.01 |
| 5.899911003441404 | 0.686 | 0.194 | 0.011 |
| 5.903052596094994 | 0.691 | 0.2 | 0.013 |
| 5.906194188748583 | 0.695 | 0.206 | 0.014 |
| 5.909335781402172 | 0.699 | 0.212 | 0.015 |
| 5.912477374055762 | 0.703 | 0.218 | 0.017 |
| 5.915618966709352 | 0.708 | 0.225 | 0.019 |
| 5.918760559362942 | 0.712 | 0.231 | 0.021 |
| 5.921902152016531 | 0.716 | 0.237 | 0.022 |
| 5.92504374467012 | 0.721 | 0.244 | 0.024 |
| 5.92818533732371 | 0.725 | 0.251 | 0.027 |
| 5.9313269299773 | 0.729 | 0.258 | 0.029 |
| 5.93446852263089 | 0.733 | 0.265 | 0.032 |
| 5.93761011528448 | 0.737 | 0.272 | 0.034 |
| 5.940751707938068 | 0.742 | 0.279 | 0.037 |
| 5.943893300591658 | 0.746 | 0.286 | 0.04 |
| 5.947034893245248 | 0.75 | 0.293 | 0.043 |
| 5.950176485898837 | 0.754 | 0.301 | 0.046 |
| 5.953318078552427 | 0.758 | 0.308 | 0.05 |
| 5.956459671206017 | 0.762 | 0.316 | 0.054 |
| 5.959601263859606 | 0.766 | 0.323 | 0.057 |
| 5.962742856513196 | 0.77 | 0.331 | 0.061 |
| 5.965884449166785 | 0.774 | 0.339 | 0.066 |
| 5.969026041820375 | 0.778 | 0.347 | 0.07 |
| 5.972167634473964 | 0.782 | 0.355 | 0.075 |
| 5.975309227127554 | 0.786 | 0.363 | 0.08 |
| 5.978450819781144 | 0.79 | 0.371 | 0.085 |
| 5.981592412434733 | 0.794 | 0.379 | 0.09 |
| 5.984734005088323 | 0.798 | 0.387 | 0.096 |
| 5.987875597741913 | 0.802 | 0.395 | 0.101 |
| 5.991017190395502 | 0.805 | 0.404 | 0.107 |
| 5.994158783049092 | 0.809 | 0.412 | 0.113 |
| 5.997300375702681 | 0.813 | 0.421 | 0.12 |
| 6.000441968356271 | 0.817 | 0.429 | 0.126 |
| 6.003583561009861 | 0.82 | 0.438 | 0.133 |
| 6.00672515366345 | 0.824 | 0.446 | 0.14 |
| 6.00986674631704 | 0.828 | 0.455 | 0.148 |
| 6.01300833897063 | 0.831 | 0.464 | 0.155 |
| 6.01614993162422 | 0.835 | 0.472 | 0.163 |
| 6.019291524277808 | 0.838 | 0.481 | 0.171 |
| 6.022433116931398 | 0.842 | 0.49 | 0.18 |
| 6.025574709584988 | 0.846 | 0.499 | 0.188 |
| 6.028716302238577 | 0.849 | 0.508 | 0.197 |
| 6.031857894892167 | 0.852 | 0.517 | 0.206 |
| 6.034999487545757 | 0.856 | 0.526 | 0.215 |
| 6.038141080199346 | 0.859 | 0.535 | 0.225 |
| 6.041282672852935 | 0.863 | 0.544 | 0.234 |
| 6.044424265506525 | 0.866 | 0.553 | 0.244 |
| 6.047565858160115 | 0.869 | 0.562 | 0.254 |
| 6.050707450813704 | 0.873 | 0.571 | 0.265 |
| 6.053849043467294 | 0.876 | 0.58 | 0.275 |
| 6.056990636120884 | 0.879 | 0.589 | 0.286 |
| 6.060132228774473 | 0.882 | 0.598 | 0.297 |
| 6.063273821428063 | 0.885 | 0.606 | 0.308 |
| 6.066415414081653 | 0.888 | 0.615 | 0.319 |
| 6.069557006735242 | 0.891 | 0.624 | 0.331 |
| 6.072698599388831 | 0.894 | 0.633 | 0.343 |
| 6.07584019204242 | 0.897 | 0.642 | 0.355 |
| 6.078981784696011 | 0.9 | 0.651 | 0.367 |
| 6.082123377349601 | 0.903 | 0.66 | 0.379 |
| 6.08526497000319 | 0.906 | 0.669 | 0.391 |
| 6.08840656265678 | 0.909 | 0.677 | 0.404 |
| 6.09154815531037 | 0.912 | 0.686 | 0.416 |
| 6.094689747963959 | 0.915 | 0.695 | 0.429 |
| 6.097831340617549 | 0.917 | 0.703 | 0.442 |
| 6.100972933271138 | 0.92 | 0.712 | 0.455 |
| 6.104114525924728 | 0.923 | 0.721 | 0.468 |
| 6.107256118578317 | 0.925 | 0.729 | 0.481 |
| 6.110397711231907 | 0.928 | 0.737 | 0.495 |
| 6.113539303885497 | 0.93 | 0.746 | 0.508 |
| 6.116680896539086 | 0.933 | 0.754 | 0.521 |
| 6.119822489192675 | 0.935 | 0.762 | 0.535 |
| 6.122964081846265 | 0.938 | 0.77 | 0.548 |
| 6.126105674499855 | 0.94 | 0.778 | 0.562 |
| 6.129247267153445 | 0.942 | 0.786 | 0.575 |
| 6.132388859807034 | 0.945 | 0.794 | 0.589 |
| 6.135530452460624 | 0.947 | 0.802 | 0.602 |
| 6.138672045114213 | 0.949 | 0.809 | 0.615 |
| 6.141813637767803 | 0.951 | 0.817 | 0.629 |
| 6.144955230421393 | 0.953 | 0.824 | 0.642 |
| 6.148096823074982 | 0.955 | 0.831 | 0.655 |
| 6.151238415728571 | 0.957 | 0.838 | 0.669 |
| 6.154380008382161 | 0.959 | 0.846 | 0.682 |
| 6.157521601035751 | 0.961 | 0.852 | 0.695 |
| 6.16066319368934 | 0.963 | 0.859 | 0.708 |
| 6.16380478634293 | 0.965 | 0.866 | 0.721 |
| 6.16694637899652 | 0.967 | 0.873 | 0.733 |
| 6.170087971650109 | 0.968 | 0.879 | 0.746 |
| 6.173229564303698 | 0.97 | 0.885 | 0.758 |
| 6.176371156957289 | 0.972 | 0.891 | 0.77 |
| 6.179512749610878 | 0.973 | 0.897 | 0.782 |
| 6.182654342264468 | 0.975 | 0.903 | 0.794 |
| 6.185795934918057 | 0.977 | 0.909 | 0.805 |
| 6.188937527571647 | 0.978 | 0.915 | 0.817 |
| 6.192079120225237 | 0.979 | 0.92 | 0.828 |
| 6.195220712878826 | 0.981 | 0.925 | 0.838 |
| 6.198362305532415 | 0.982 | 0.93 | 0.849 |
| 6.201503898186005 | 0.983 | 0.935 | 0.859 |
| 6.204645490839594 | 0.985 | 0.94 | 0.869 |
| 6.207787083493184 | 0.986 | 0.945 | 0.879 |
| 6.210928676146774 | 0.987 | 0.949 | 0.888 |
| 6.214070268800364 | 0.988 | 0.953 | 0.897 |
| 6.217211861453953 | 0.989 | 0.957 | 0.906 |
| 6.220353454107543 | 0.99 | 0.961 | 0.915 |
| 6.223495046761133 | 0.991 | 0.965 | 0.923 |
| 6.226636639414722 | 0.992 | 0.968 | 0.93 |
| 6.229778232068312 | 0.993 | 0.972 | 0.938 |
| 6.232919824721901 | 0.994 | 0.975 | 0.945 |
| 6.236061417375491 | 0.994 | 0.978 | 0.951 |
| 6.23920301002908 | 0.995 | 0.981 | 0.957 |
| 6.24234460268267 | 0.996 | 0.983 | 0.963 |
| 6.24548619533626 | 0.996 | 0.986 | 0.968 |
| 6.24862778798985 | 0.997 | 0.988 | 0.973 |
| 6.251769380643438 | 0.998 | 0.99 | 0.978 |
| 6.254910973297028 | 0.998 | 0.992 | 0.982 |
| 6.258052565950618 | 0.998 | 0.994 | 0.986 |
| 6.261194158604208 | 0.999 | 0.995 | 0.989 |
| 6.264335751257797 | 0.999 | 0.996 | 0.992 |
| 6.267477343911387 | 0.999 | 0.998 | 0.994 |
| 6.270618936564976 | 1 | 0.998 | 0.996 |
| 6.273760529218566 | 1 | 0.999 | 0.998 |
| 6.276902121872155 | 1 | 1 | 0.999 |
| 6.280043714525745 | 1 | 1 | 1 |
| 6.283185307179335 | 1 | 1 | 1 |